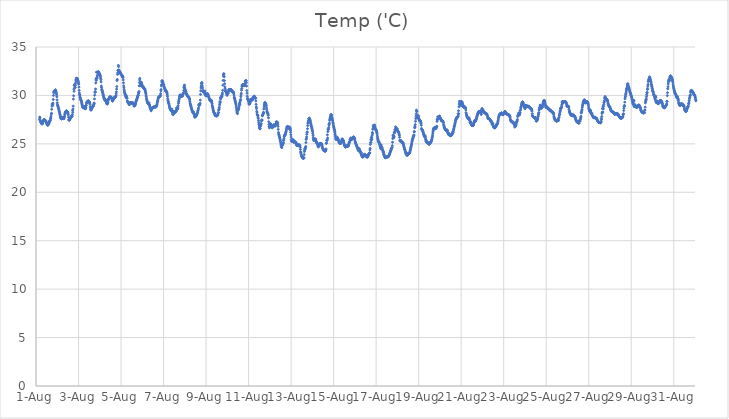
| Category | Temp ('C) |
|---|---|
| 44774.166666666664 | 27.53 |
| 44774.177083333336 | 27.764 |
| 44774.1875 | 27.685 |
| 44774.197916666664 | 27.422 |
| 44774.208333333336 | 27.408 |
| 44774.21875 | 27.271 |
| 44774.229166666664 | 27.233 |
| 44774.239583333336 | 27.194 |
| 44774.25 | 27.159 |
| 44774.260416666664 | 27.115 |
| 44774.270833333336 | 27.08 |
| 44774.28125 | 27.086 |
| 44774.291666666664 | 27.05 |
| 44774.302083333336 | 27.096 |
| 44774.3125 | 27.124 |
| 44774.322916666664 | 27.233 |
| 44774.333333333336 | 27.319 |
| 44774.34375 | 27.361 |
| 44774.354166666664 | 27.417 |
| 44774.364583333336 | 27.465 |
| 44774.375 | 27.492 |
| 44774.385416666664 | 27.49 |
| 44774.395833333336 | 27.493 |
| 44774.40625 | 27.49 |
| 44774.416666666664 | 27.468 |
| 44774.427083333336 | 27.395 |
| 44774.4375 | 27.359 |
| 44774.447916666664 | 27.381 |
| 44774.458333333336 | 27.374 |
| 44774.46875 | 27.339 |
| 44774.479166666664 | 27.259 |
| 44774.489583333336 | 27.196 |
| 44774.5 | 27.146 |
| 44774.510416666664 | 27.075 |
| 44774.520833333336 | 26.983 |
| 44774.53125 | 26.963 |
| 44774.541666666664 | 26.947 |
| 44774.552083333336 | 26.949 |
| 44774.5625 | 26.937 |
| 44774.572916666664 | 26.963 |
| 44774.583333333336 | 27.016 |
| 44774.59375 | 27.066 |
| 44774.604166666664 | 27.12 |
| 44774.614583333336 | 27.188 |
| 44774.625 | 27.265 |
| 44774.635416666664 | 27.316 |
| 44774.645833333336 | 27.355 |
| 44774.65625 | 27.395 |
| 44774.666666666664 | 27.405 |
| 44774.677083333336 | 27.499 |
| 44774.6875 | 27.654 |
| 44774.697916666664 | 27.677 |
| 44774.708333333336 | 27.872 |
| 44774.71875 | 28.084 |
| 44774.729166666664 | 28.154 |
| 44774.739583333336 | 28.573 |
| 44774.75 | 28.884 |
| 44774.760416666664 | 29.088 |
| 44774.770833333336 | 29.148 |
| 44774.78125 | 28.966 |
| 44774.791666666664 | 29.074 |
| 44774.802083333336 | 29.199 |
| 44774.8125 | 29.58 |
| 44774.822916666664 | 30 |
| 44774.833333333336 | 30.273 |
| 44774.84375 | 30.405 |
| 44774.854166666664 | 30.425 |
| 44774.864583333336 | 30.48 |
| 44774.875 | 30.445 |
| 44774.885416666664 | 30.487 |
| 44774.895833333336 | 30.521 |
| 44774.90625 | 30.548 |
| 44774.916666666664 | 30.581 |
| 44774.927083333336 | 30.435 |
| 44774.9375 | 30.391 |
| 44774.947916666664 | 30.339 |
| 44774.958333333336 | 30.21 |
| 44774.96875 | 30.063 |
| 44774.979166666664 | 29.861 |
| 44774.989583333336 | 29.539 |
| 44775.0 | 29.241 |
| 44775.010416666664 | 29.052 |
| 44775.020833333336 | 28.952 |
| 44775.03125 | 28.892 |
| 44775.041666666664 | 28.828 |
| 44775.052083333336 | 28.727 |
| 44775.0625 | 28.665 |
| 44775.072916666664 | 28.57 |
| 44775.083333333336 | 28.473 |
| 44775.09375 | 28.367 |
| 44775.104166666664 | 28.268 |
| 44775.114583333336 | 28.146 |
| 44775.125 | 28.06 |
| 44775.135416666664 | 27.947 |
| 44775.145833333336 | 27.833 |
| 44775.15625 | 27.717 |
| 44775.166666666664 | 27.687 |
| 44775.177083333336 | 27.611 |
| 44775.1875 | 27.578 |
| 44775.197916666664 | 27.567 |
| 44775.208333333336 | 27.768 |
| 44775.21875 | 27.731 |
| 44775.229166666664 | 27.665 |
| 44775.239583333336 | 27.702 |
| 44775.25 | 27.696 |
| 44775.260416666664 | 27.687 |
| 44775.270833333336 | 27.684 |
| 44775.28125 | 27.606 |
| 44775.291666666664 | 27.636 |
| 44775.302083333336 | 27.612 |
| 44775.3125 | 27.591 |
| 44775.322916666664 | 27.691 |
| 44775.333333333336 | 27.803 |
| 44775.34375 | 27.846 |
| 44775.354166666664 | 28.025 |
| 44775.364583333336 | 28.114 |
| 44775.375 | 28.257 |
| 44775.385416666664 | 28.258 |
| 44775.395833333336 | 28.319 |
| 44775.40625 | 28.335 |
| 44775.416666666664 | 28.388 |
| 44775.427083333336 | 28.39 |
| 44775.4375 | 28.373 |
| 44775.447916666664 | 28.384 |
| 44775.458333333336 | 28.342 |
| 44775.46875 | 28.266 |
| 44775.479166666664 | 28.266 |
| 44775.489583333336 | 28.272 |
| 44775.5 | 28.216 |
| 44775.510416666664 | 28.096 |
| 44775.520833333336 | 27.987 |
| 44775.53125 | 27.75 |
| 44775.541666666664 | 27.509 |
| 44775.552083333336 | 27.428 |
| 44775.5625 | 27.467 |
| 44775.572916666664 | 27.479 |
| 44775.583333333336 | 27.503 |
| 44775.59375 | 27.556 |
| 44775.604166666664 | 27.605 |
| 44775.614583333336 | 27.641 |
| 44775.625 | 27.69 |
| 44775.635416666664 | 27.74 |
| 44775.645833333336 | 27.775 |
| 44775.65625 | 27.805 |
| 44775.666666666664 | 27.833 |
| 44775.677083333336 | 27.827 |
| 44775.6875 | 27.832 |
| 44775.697916666664 | 27.881 |
| 44775.708333333336 | 28.022 |
| 44775.71875 | 28.442 |
| 44775.729166666664 | 28.248 |
| 44775.739583333336 | 28.591 |
| 44775.75 | 28.893 |
| 44775.760416666664 | 29.619 |
| 44775.770833333336 | 29.967 |
| 44775.78125 | 30.652 |
| 44775.791666666664 | 30.427 |
| 44775.802083333336 | 31.024 |
| 44775.8125 | 31.125 |
| 44775.822916666664 | 31.078 |
| 44775.833333333336 | 30.803 |
| 44775.84375 | 30.831 |
| 44775.854166666664 | 31.056 |
| 44775.864583333336 | 31.283 |
| 44775.875 | 31.498 |
| 44775.885416666664 | 31.641 |
| 44775.895833333336 | 31.743 |
| 44775.90625 | 31.746 |
| 44775.916666666664 | 31.786 |
| 44775.927083333336 | 31.723 |
| 44775.9375 | 31.752 |
| 44775.947916666664 | 31.729 |
| 44775.958333333336 | 31.615 |
| 44775.96875 | 31.535 |
| 44775.979166666664 | 31.486 |
| 44775.989583333336 | 31.399 |
| 44776.0 | 31.289 |
| 44776.010416666664 | 31.159 |
| 44776.020833333336 | 30.855 |
| 44776.03125 | 30.524 |
| 44776.041666666664 | 30.247 |
| 44776.052083333336 | 30.093 |
| 44776.0625 | 29.959 |
| 44776.072916666664 | 29.811 |
| 44776.083333333336 | 29.739 |
| 44776.09375 | 29.647 |
| 44776.104166666664 | 29.558 |
| 44776.114583333336 | 29.519 |
| 44776.125 | 29.47 |
| 44776.135416666664 | 29.404 |
| 44776.145833333336 | 29.276 |
| 44776.15625 | 29.165 |
| 44776.166666666664 | 29.049 |
| 44776.177083333336 | 28.94 |
| 44776.1875 | 28.836 |
| 44776.197916666664 | 28.758 |
| 44776.208333333336 | 28.782 |
| 44776.21875 | 28.817 |
| 44776.229166666664 | 28.866 |
| 44776.239583333336 | 28.711 |
| 44776.25 | 28.854 |
| 44776.260416666664 | 28.759 |
| 44776.270833333336 | 28.811 |
| 44776.28125 | 28.788 |
| 44776.291666666664 | 28.727 |
| 44776.302083333336 | 28.66 |
| 44776.3125 | 28.675 |
| 44776.322916666664 | 28.625 |
| 44776.333333333336 | 28.64 |
| 44776.34375 | 28.77 |
| 44776.354166666664 | 28.951 |
| 44776.364583333336 | 28.991 |
| 44776.375 | 29.194 |
| 44776.385416666664 | 29.268 |
| 44776.395833333336 | 29.308 |
| 44776.40625 | 29.326 |
| 44776.416666666664 | 29.328 |
| 44776.427083333336 | 29.38 |
| 44776.4375 | 29.403 |
| 44776.447916666664 | 29.402 |
| 44776.458333333336 | 29.442 |
| 44776.46875 | 29.442 |
| 44776.479166666664 | 29.35 |
| 44776.489583333336 | 29.294 |
| 44776.5 | 29.318 |
| 44776.510416666664 | 29.323 |
| 44776.520833333336 | 29.286 |
| 44776.53125 | 29.221 |
| 44776.541666666664 | 29.085 |
| 44776.552083333336 | 28.827 |
| 44776.5625 | 28.693 |
| 44776.572916666664 | 28.532 |
| 44776.583333333336 | 28.485 |
| 44776.59375 | 28.51 |
| 44776.604166666664 | 28.547 |
| 44776.614583333336 | 28.596 |
| 44776.625 | 28.659 |
| 44776.635416666664 | 28.719 |
| 44776.645833333336 | 28.785 |
| 44776.65625 | 28.815 |
| 44776.666666666664 | 28.867 |
| 44776.677083333336 | 28.905 |
| 44776.6875 | 28.854 |
| 44776.697916666664 | 28.937 |
| 44776.708333333336 | 28.981 |
| 44776.71875 | 29.075 |
| 44776.729166666664 | 29.21 |
| 44776.739583333336 | 29.178 |
| 44776.75 | 29.644 |
| 44776.760416666664 | 30.02 |
| 44776.770833333336 | 30.356 |
| 44776.78125 | 30.318 |
| 44776.791666666664 | 30.392 |
| 44776.802083333336 | 30.665 |
| 44776.8125 | 31.287 |
| 44776.822916666664 | 31.683 |
| 44776.833333333336 | 31.542 |
| 44776.84375 | 32.399 |
| 44776.854166666664 | 31.808 |
| 44776.864583333336 | 31.748 |
| 44776.875 | 31.865 |
| 44776.885416666664 | 32.049 |
| 44776.895833333336 | 32.07 |
| 44776.90625 | 32.381 |
| 44776.916666666664 | 32.363 |
| 44776.927083333336 | 32.469 |
| 44776.9375 | 32.378 |
| 44776.947916666664 | 32.37 |
| 44776.958333333336 | 32.4 |
| 44776.96875 | 32.295 |
| 44776.979166666664 | 32.267 |
| 44776.989583333336 | 32.204 |
| 44777.0 | 32.138 |
| 44777.010416666664 | 32.074 |
| 44777.020833333336 | 32.019 |
| 44777.03125 | 31.933 |
| 44777.041666666664 | 31.772 |
| 44777.052083333336 | 31.632 |
| 44777.0625 | 31.394 |
| 44777.072916666664 | 30.97 |
| 44777.083333333336 | 30.81 |
| 44777.09375 | 30.618 |
| 44777.104166666664 | 30.554 |
| 44777.114583333336 | 30.483 |
| 44777.125 | 30.384 |
| 44777.135416666664 | 30.301 |
| 44777.145833333336 | 30.159 |
| 44777.15625 | 30.123 |
| 44777.166666666664 | 30.016 |
| 44777.177083333336 | 29.925 |
| 44777.1875 | 29.8 |
| 44777.197916666664 | 29.74 |
| 44777.208333333336 | 29.677 |
| 44777.21875 | 29.615 |
| 44777.229166666664 | 29.566 |
| 44777.239583333336 | 29.537 |
| 44777.25 | 29.475 |
| 44777.260416666664 | 29.57 |
| 44777.270833333336 | 29.563 |
| 44777.28125 | 29.494 |
| 44777.291666666664 | 29.459 |
| 44777.302083333336 | 29.374 |
| 44777.3125 | 29.274 |
| 44777.322916666664 | 29.157 |
| 44777.333333333336 | 29.169 |
| 44777.34375 | 29.171 |
| 44777.354166666664 | 29.098 |
| 44777.364583333336 | 29.331 |
| 44777.375 | 29.205 |
| 44777.385416666664 | 29.285 |
| 44777.395833333336 | 29.486 |
| 44777.40625 | 29.582 |
| 44777.416666666664 | 29.662 |
| 44777.427083333336 | 29.655 |
| 44777.4375 | 29.708 |
| 44777.447916666664 | 29.741 |
| 44777.458333333336 | 29.796 |
| 44777.46875 | 29.835 |
| 44777.479166666664 | 29.848 |
| 44777.489583333336 | 29.867 |
| 44777.5 | 29.85 |
| 44777.510416666664 | 29.831 |
| 44777.520833333336 | 29.8 |
| 44777.53125 | 29.82 |
| 44777.541666666664 | 29.8 |
| 44777.552083333336 | 29.738 |
| 44777.5625 | 29.716 |
| 44777.572916666664 | 29.592 |
| 44777.583333333336 | 29.498 |
| 44777.59375 | 29.445 |
| 44777.604166666664 | 29.431 |
| 44777.614583333336 | 29.463 |
| 44777.625 | 29.539 |
| 44777.635416666664 | 29.597 |
| 44777.645833333336 | 29.631 |
| 44777.65625 | 29.683 |
| 44777.666666666664 | 29.717 |
| 44777.677083333336 | 29.771 |
| 44777.6875 | 29.798 |
| 44777.697916666664 | 29.794 |
| 44777.708333333336 | 29.781 |
| 44777.71875 | 29.827 |
| 44777.729166666664 | 29.814 |
| 44777.739583333336 | 29.848 |
| 44777.75 | 29.897 |
| 44777.760416666664 | 29.973 |
| 44777.770833333336 | 30.159 |
| 44777.78125 | 30.368 |
| 44777.791666666664 | 30.655 |
| 44777.802083333336 | 30.919 |
| 44777.8125 | 31.543 |
| 44777.822916666664 | 31.651 |
| 44777.833333333336 | 32.173 |
| 44777.84375 | 32.328 |
| 44777.854166666664 | 32.586 |
| 44777.864583333336 | 32.587 |
| 44777.875 | 33.096 |
| 44777.885416666664 | 32.98 |
| 44777.895833333336 | 32.639 |
| 44777.90625 | 32.479 |
| 44777.916666666664 | 32.376 |
| 44777.927083333336 | 32.474 |
| 44777.9375 | 32.482 |
| 44777.947916666664 | 32.425 |
| 44777.958333333336 | 32.353 |
| 44777.96875 | 32.295 |
| 44777.979166666664 | 32.265 |
| 44777.989583333336 | 32.235 |
| 44778.0 | 32.183 |
| 44778.010416666664 | 32.167 |
| 44778.020833333336 | 32.131 |
| 44778.03125 | 32.116 |
| 44778.041666666664 | 32.056 |
| 44778.052083333336 | 31.924 |
| 44778.0625 | 31.999 |
| 44778.072916666664 | 31.999 |
| 44778.083333333336 | 31.959 |
| 44778.09375 | 31.838 |
| 44778.104166666664 | 31.601 |
| 44778.114583333336 | 31.298 |
| 44778.125 | 30.983 |
| 44778.135416666664 | 30.793 |
| 44778.145833333336 | 30.585 |
| 44778.15625 | 30.44 |
| 44778.166666666664 | 30.316 |
| 44778.177083333336 | 30.226 |
| 44778.1875 | 30.147 |
| 44778.197916666664 | 30.104 |
| 44778.208333333336 | 30.022 |
| 44778.21875 | 29.92 |
| 44778.229166666664 | 29.85 |
| 44778.239583333336 | 29.781 |
| 44778.25 | 29.811 |
| 44778.260416666664 | 29.933 |
| 44778.270833333336 | 29.784 |
| 44778.28125 | 29.693 |
| 44778.291666666664 | 29.427 |
| 44778.302083333336 | 29.385 |
| 44778.3125 | 29.343 |
| 44778.322916666664 | 29.333 |
| 44778.333333333336 | 29.258 |
| 44778.34375 | 29.226 |
| 44778.354166666664 | 29.218 |
| 44778.364583333336 | 29.251 |
| 44778.375 | 29.063 |
| 44778.385416666664 | 29.107 |
| 44778.395833333336 | 29.125 |
| 44778.40625 | 29.066 |
| 44778.416666666664 | 29.119 |
| 44778.427083333336 | 29.185 |
| 44778.4375 | 29.243 |
| 44778.447916666664 | 29.253 |
| 44778.458333333336 | 29.281 |
| 44778.46875 | 29.274 |
| 44778.479166666664 | 29.245 |
| 44778.489583333336 | 29.208 |
| 44778.5 | 29.241 |
| 44778.510416666664 | 29.24 |
| 44778.520833333336 | 29.235 |
| 44778.53125 | 29.228 |
| 44778.541666666664 | 29.192 |
| 44778.552083333336 | 29.186 |
| 44778.5625 | 29.213 |
| 44778.572916666664 | 29.211 |
| 44778.583333333336 | 29.165 |
| 44778.59375 | 29.079 |
| 44778.604166666664 | 29.01 |
| 44778.614583333336 | 28.901 |
| 44778.625 | 28.918 |
| 44778.635416666664 | 28.933 |
| 44778.645833333336 | 28.95 |
| 44778.65625 | 28.978 |
| 44778.666666666664 | 29.048 |
| 44778.677083333336 | 29.131 |
| 44778.6875 | 29.219 |
| 44778.697916666664 | 29.336 |
| 44778.708333333336 | 29.402 |
| 44778.71875 | 29.468 |
| 44778.729166666664 | 29.524 |
| 44778.739583333336 | 29.595 |
| 44778.75 | 29.662 |
| 44778.760416666664 | 29.736 |
| 44778.770833333336 | 29.812 |
| 44778.78125 | 29.876 |
| 44778.791666666664 | 29.952 |
| 44778.802083333336 | 30.008 |
| 44778.8125 | 30.05 |
| 44778.822916666664 | 30.247 |
| 44778.833333333336 | 30.28 |
| 44778.84375 | 30.417 |
| 44778.854166666664 | 30.987 |
| 44778.864583333336 | 31.334 |
| 44778.875 | 31.599 |
| 44778.885416666664 | 31.754 |
| 44778.895833333336 | 31.001 |
| 44778.90625 | 31.283 |
| 44778.916666666664 | 31.038 |
| 44778.927083333336 | 31.058 |
| 44778.9375 | 31.188 |
| 44778.947916666664 | 31.373 |
| 44778.958333333336 | 31.33 |
| 44778.96875 | 31.232 |
| 44778.979166666664 | 31.12 |
| 44778.989583333336 | 31.041 |
| 44779.0 | 30.965 |
| 44779.010416666664 | 30.93 |
| 44779.020833333336 | 30.894 |
| 44779.03125 | 30.859 |
| 44779.041666666664 | 30.851 |
| 44779.052083333336 | 30.839 |
| 44779.0625 | 30.854 |
| 44779.072916666664 | 30.737 |
| 44779.083333333336 | 30.681 |
| 44779.09375 | 30.713 |
| 44779.104166666664 | 30.694 |
| 44779.114583333336 | 30.675 |
| 44779.125 | 30.642 |
| 44779.135416666664 | 30.539 |
| 44779.145833333336 | 30.419 |
| 44779.15625 | 30.317 |
| 44779.166666666664 | 30.188 |
| 44779.177083333336 | 30.041 |
| 44779.1875 | 29.884 |
| 44779.197916666664 | 29.71 |
| 44779.208333333336 | 29.573 |
| 44779.21875 | 29.478 |
| 44779.229166666664 | 29.377 |
| 44779.239583333336 | 29.323 |
| 44779.25 | 29.244 |
| 44779.260416666664 | 29.203 |
| 44779.270833333336 | 29.175 |
| 44779.28125 | 29.159 |
| 44779.291666666664 | 29.11 |
| 44779.302083333336 | 29.084 |
| 44779.3125 | 29.062 |
| 44779.322916666664 | 29.221 |
| 44779.333333333336 | 29.055 |
| 44779.34375 | 28.986 |
| 44779.354166666664 | 28.832 |
| 44779.364583333336 | 28.71 |
| 44779.375 | 28.744 |
| 44779.385416666664 | 28.684 |
| 44779.395833333336 | 28.541 |
| 44779.40625 | 28.553 |
| 44779.416666666664 | 28.41 |
| 44779.427083333336 | 28.52 |
| 44779.4375 | 28.619 |
| 44779.447916666664 | 28.642 |
| 44779.458333333336 | 28.669 |
| 44779.46875 | 28.705 |
| 44779.479166666664 | 28.738 |
| 44779.489583333336 | 28.752 |
| 44779.5 | 28.771 |
| 44779.510416666664 | 28.749 |
| 44779.520833333336 | 28.719 |
| 44779.53125 | 28.783 |
| 44779.541666666664 | 28.807 |
| 44779.552083333336 | 28.813 |
| 44779.5625 | 28.808 |
| 44779.572916666664 | 28.825 |
| 44779.583333333336 | 28.809 |
| 44779.59375 | 28.808 |
| 44779.604166666664 | 28.821 |
| 44779.614583333336 | 28.836 |
| 44779.625 | 28.824 |
| 44779.635416666664 | 28.81 |
| 44779.645833333336 | 28.814 |
| 44779.65625 | 28.867 |
| 44779.666666666664 | 28.903 |
| 44779.677083333336 | 28.973 |
| 44779.6875 | 29.058 |
| 44779.697916666664 | 29.193 |
| 44779.708333333336 | 29.312 |
| 44779.71875 | 29.395 |
| 44779.729166666664 | 29.476 |
| 44779.739583333336 | 29.621 |
| 44779.75 | 29.712 |
| 44779.760416666664 | 29.78 |
| 44779.770833333336 | 29.806 |
| 44779.78125 | 29.855 |
| 44779.791666666664 | 29.869 |
| 44779.802083333336 | 29.864 |
| 44779.8125 | 29.881 |
| 44779.822916666664 | 29.909 |
| 44779.833333333336 | 29.923 |
| 44779.84375 | 29.955 |
| 44779.854166666664 | 30.004 |
| 44779.864583333336 | 30.181 |
| 44779.875 | 30.467 |
| 44779.885416666664 | 30.608 |
| 44779.895833333336 | 30.989 |
| 44779.90625 | 31.1 |
| 44779.916666666664 | 31.397 |
| 44779.927083333336 | 31.513 |
| 44779.9375 | 31.509 |
| 44779.947916666664 | 31.378 |
| 44779.958333333336 | 31.416 |
| 44779.96875 | 31.384 |
| 44779.979166666664 | 31.28 |
| 44779.989583333336 | 31.156 |
| 44780.0 | 31.092 |
| 44780.010416666664 | 31.086 |
| 44780.020833333336 | 30.942 |
| 44780.03125 | 30.828 |
| 44780.041666666664 | 30.802 |
| 44780.052083333336 | 30.726 |
| 44780.0625 | 30.673 |
| 44780.072916666664 | 30.622 |
| 44780.083333333336 | 30.567 |
| 44780.09375 | 30.489 |
| 44780.104166666664 | 30.445 |
| 44780.114583333336 | 30.432 |
| 44780.125 | 30.385 |
| 44780.135416666664 | 30.4 |
| 44780.145833333336 | 30.414 |
| 44780.15625 | 30.303 |
| 44780.166666666664 | 30.194 |
| 44780.177083333336 | 30.056 |
| 44780.1875 | 29.885 |
| 44780.197916666664 | 29.654 |
| 44780.208333333336 | 29.498 |
| 44780.21875 | 29.39 |
| 44780.229166666664 | 29.302 |
| 44780.239583333336 | 29.209 |
| 44780.25 | 29.139 |
| 44780.260416666664 | 29.028 |
| 44780.270833333336 | 28.912 |
| 44780.28125 | 28.813 |
| 44780.291666666664 | 28.713 |
| 44780.302083333336 | 28.657 |
| 44780.3125 | 28.599 |
| 44780.322916666664 | 28.568 |
| 44780.333333333336 | 28.54 |
| 44780.34375 | 28.5 |
| 44780.354166666664 | 28.457 |
| 44780.364583333336 | 28.427 |
| 44780.375 | 28.398 |
| 44780.385416666664 | 28.6 |
| 44780.395833333336 | 28.466 |
| 44780.40625 | 28.343 |
| 44780.416666666664 | 28.232 |
| 44780.427083333336 | 28.211 |
| 44780.4375 | 28.03 |
| 44780.447916666664 | 28.124 |
| 44780.458333333336 | 28.036 |
| 44780.46875 | 28.18 |
| 44780.479166666664 | 28.359 |
| 44780.489583333336 | 28.368 |
| 44780.5 | 28.322 |
| 44780.510416666664 | 28.285 |
| 44780.520833333336 | 28.273 |
| 44780.53125 | 28.297 |
| 44780.541666666664 | 28.26 |
| 44780.552083333336 | 28.259 |
| 44780.5625 | 28.292 |
| 44780.572916666664 | 28.326 |
| 44780.583333333336 | 28.357 |
| 44780.59375 | 28.384 |
| 44780.604166666664 | 28.513 |
| 44780.614583333336 | 28.705 |
| 44780.625 | 28.717 |
| 44780.635416666664 | 28.605 |
| 44780.645833333336 | 28.57 |
| 44780.65625 | 28.571 |
| 44780.666666666664 | 28.64 |
| 44780.677083333336 | 28.765 |
| 44780.6875 | 28.942 |
| 44780.697916666664 | 29.176 |
| 44780.708333333336 | 29.336 |
| 44780.71875 | 29.414 |
| 44780.729166666664 | 29.565 |
| 44780.739583333336 | 29.715 |
| 44780.75 | 29.832 |
| 44780.760416666664 | 29.924 |
| 44780.770833333336 | 30.024 |
| 44780.78125 | 30.06 |
| 44780.791666666664 | 29.971 |
| 44780.802083333336 | 29.94 |
| 44780.8125 | 29.934 |
| 44780.822916666664 | 29.927 |
| 44780.833333333336 | 29.898 |
| 44780.84375 | 29.934 |
| 44780.854166666664 | 29.924 |
| 44780.864583333336 | 29.944 |
| 44780.875 | 29.945 |
| 44780.885416666664 | 29.945 |
| 44780.895833333336 | 29.943 |
| 44780.90625 | 30.083 |
| 44780.916666666664 | 30.162 |
| 44780.927083333336 | 30.191 |
| 44780.9375 | 30.261 |
| 44780.947916666664 | 30.512 |
| 44780.958333333336 | 30.799 |
| 44780.96875 | 30.893 |
| 44780.979166666664 | 31.05 |
| 44780.989583333336 | 31.032 |
| 44781.0 | 30.776 |
| 44781.010416666664 | 30.658 |
| 44781.020833333336 | 30.56 |
| 44781.03125 | 30.474 |
| 44781.041666666664 | 30.422 |
| 44781.052083333336 | 30.376 |
| 44781.0625 | 30.238 |
| 44781.072916666664 | 30.15 |
| 44781.083333333336 | 30.141 |
| 44781.09375 | 30.093 |
| 44781.104166666664 | 30.052 |
| 44781.114583333336 | 30.001 |
| 44781.125 | 29.959 |
| 44781.135416666664 | 29.905 |
| 44781.145833333336 | 29.874 |
| 44781.15625 | 29.86 |
| 44781.166666666664 | 29.818 |
| 44781.177083333336 | 29.829 |
| 44781.1875 | 29.837 |
| 44781.197916666664 | 29.819 |
| 44781.208333333336 | 29.715 |
| 44781.21875 | 29.644 |
| 44781.229166666664 | 29.536 |
| 44781.239583333336 | 29.369 |
| 44781.25 | 29.198 |
| 44781.260416666664 | 29.104 |
| 44781.270833333336 | 29.018 |
| 44781.28125 | 28.932 |
| 44781.291666666664 | 28.855 |
| 44781.302083333336 | 28.757 |
| 44781.3125 | 28.678 |
| 44781.322916666664 | 28.572 |
| 44781.333333333336 | 28.5 |
| 44781.34375 | 28.44 |
| 44781.354166666664 | 28.36 |
| 44781.364583333336 | 28.312 |
| 44781.375 | 28.271 |
| 44781.385416666664 | 28.22 |
| 44781.395833333336 | 28.191 |
| 44781.40625 | 28.162 |
| 44781.416666666664 | 28.291 |
| 44781.427083333336 | 28.154 |
| 44781.4375 | 28.045 |
| 44781.447916666664 | 28.015 |
| 44781.458333333336 | 27.815 |
| 44781.46875 | 27.751 |
| 44781.479166666664 | 27.987 |
| 44781.489583333336 | 27.804 |
| 44781.5 | 27.796 |
| 44781.510416666664 | 27.919 |
| 44781.520833333336 | 27.973 |
| 44781.53125 | 27.966 |
| 44781.541666666664 | 27.91 |
| 44781.55210648148 | 27.921 |
| 44781.5625 | 27.993 |
| 44781.572916666664 | 28.086 |
| 44781.583333333336 | 28.106 |
| 44781.59375 | 28.216 |
| 44781.604166666664 | 28.302 |
| 44781.614583333336 | 28.409 |
| 44781.625 | 28.481 |
| 44781.635416666664 | 28.597 |
| 44781.645833333336 | 28.716 |
| 44781.65625 | 28.97 |
| 44781.666666666664 | 29.051 |
| 44781.677083333336 | 29.081 |
| 44781.6875 | 29.053 |
| 44781.697916666664 | 28.99 |
| 44781.708333333336 | 29.078 |
| 44781.71875 | 29.186 |
| 44781.729166666664 | 29.515 |
| 44781.739583333336 | 30.104 |
| 44781.75 | 30.48 |
| 44781.760416666664 | 30.781 |
| 44781.770833333336 | 30.982 |
| 44781.78125 | 31.219 |
| 44781.791666666664 | 31.289 |
| 44781.802083333336 | 31.33 |
| 44781.8125 | 31.213 |
| 44781.822916666664 | 30.972 |
| 44781.833333333336 | 30.774 |
| 44781.84375 | 30.533 |
| 44781.854166666664 | 30.381 |
| 44781.864583333336 | 30.371 |
| 44781.875 | 30.365 |
| 44781.885416666664 | 30.392 |
| 44781.895833333336 | 30.399 |
| 44781.90625 | 30.403 |
| 44781.916666666664 | 30.354 |
| 44781.927083333336 | 30.286 |
| 44781.9375 | 30.156 |
| 44781.947916666664 | 30.465 |
| 44781.958333333336 | 30.238 |
| 44781.96875 | 30.097 |
| 44781.979166666664 | 29.993 |
| 44781.989583333336 | 29.96 |
| 44782.0 | 30.027 |
| 44782.010416666664 | 29.998 |
| 44782.020833333336 | 29.971 |
| 44782.03125 | 30.143 |
| 44782.041666666664 | 30.032 |
| 44782.052083333336 | 30.051 |
| 44782.0625 | 30.186 |
| 44782.072916666664 | 30.16 |
| 44782.083333333336 | 30.073 |
| 44782.09375 | 30.09 |
| 44782.104166666664 | 29.955 |
| 44782.114583333336 | 29.916 |
| 44782.125 | 29.854 |
| 44782.135416666664 | 29.796 |
| 44782.145833333336 | 29.702 |
| 44782.15625 | 29.64 |
| 44782.166666666664 | 29.594 |
| 44782.177083333336 | 29.537 |
| 44782.1875 | 29.498 |
| 44782.197916666664 | 29.447 |
| 44782.208333333336 | 29.445 |
| 44782.21875 | 29.441 |
| 44782.229166666664 | 29.46 |
| 44782.239583333336 | 29.477 |
| 44782.25 | 29.497 |
| 44782.260416666664 | 29.411 |
| 44782.270833333336 | 29.306 |
| 44782.28125 | 29.146 |
| 44782.291666666664 | 28.971 |
| 44782.302083333336 | 28.843 |
| 44782.3125 | 28.746 |
| 44782.322916666664 | 28.631 |
| 44782.333333333336 | 28.512 |
| 44782.34375 | 28.431 |
| 44782.354166666664 | 28.335 |
| 44782.364583333336 | 28.264 |
| 44782.375 | 28.222 |
| 44782.385416666664 | 28.185 |
| 44782.395833333336 | 28.144 |
| 44782.40625 | 28.093 |
| 44782.416666666664 | 28.014 |
| 44782.427083333336 | 27.952 |
| 44782.4375 | 27.935 |
| 44782.447916666664 | 27.923 |
| 44782.458333333336 | 27.901 |
| 44782.46875 | 27.929 |
| 44782.479166666664 | 27.9 |
| 44782.489583333336 | 27.895 |
| 44782.5 | 27.881 |
| 44782.510416666664 | 27.912 |
| 44782.520833333336 | 27.942 |
| 44782.53125 | 27.974 |
| 44782.541666666664 | 27.976 |
| 44782.552083333336 | 27.97 |
| 44782.5625 | 28.098 |
| 44782.572916666664 | 28.224 |
| 44782.583333333336 | 28.242 |
| 44782.59375 | 28.497 |
| 44782.604166666664 | 28.523 |
| 44782.614583333336 | 28.615 |
| 44782.625 | 28.783 |
| 44782.635416666664 | 29.026 |
| 44782.645833333336 | 29.211 |
| 44782.65625 | 29.365 |
| 44782.666666666664 | 29.304 |
| 44782.677083333336 | 29.724 |
| 44782.6875 | 29.618 |
| 44782.697916666664 | 29.753 |
| 44782.708333333336 | 29.893 |
| 44782.71875 | 29.828 |
| 44782.729166666664 | 29.818 |
| 44782.739583333336 | 29.848 |
| 44782.75 | 29.931 |
| 44782.760416666664 | 30.09 |
| 44782.770833333336 | 30.241 |
| 44782.78125 | 30.52 |
| 44782.791666666664 | 31.06 |
| 44782.802083333336 | 31.55 |
| 44782.8125 | 32.008 |
| 44782.822916666664 | 32.134 |
| 44782.833333333336 | 32.245 |
| 44782.84375 | 32.207 |
| 44782.854166666664 | 31.927 |
| 44782.864583333336 | 31.526 |
| 44782.875 | 31.208 |
| 44782.885416666664 | 30.886 |
| 44782.895833333336 | 30.708 |
| 44782.90625 | 30.425 |
| 44782.916666666664 | 30.521 |
| 44782.927083333336 | 30.467 |
| 44782.9375 | 30.437 |
| 44782.947916666664 | 30.38 |
| 44782.958333333336 | 30.288 |
| 44782.96875 | 30.174 |
| 44782.979166666664 | 30.097 |
| 44782.989583333336 | 30.001 |
| 44783.0 | 30.189 |
| 44783.010416666664 | 30.296 |
| 44783.020833333336 | 30.283 |
| 44783.03125 | 30.257 |
| 44783.041666666664 | 30.203 |
| 44783.052083333336 | 30.414 |
| 44783.0625 | 30.453 |
| 44783.072916666664 | 30.598 |
| 44783.083333333336 | 30.611 |
| 44783.09375 | 30.621 |
| 44783.104166666664 | 30.565 |
| 44783.114583333336 | 30.566 |
| 44783.125 | 30.517 |
| 44783.135416666664 | 30.527 |
| 44783.145833333336 | 30.61 |
| 44783.15625 | 30.615 |
| 44783.166666666664 | 30.614 |
| 44783.177083333336 | 30.589 |
| 44783.1875 | 30.563 |
| 44783.197916666664 | 30.497 |
| 44783.208333333336 | 30.394 |
| 44783.21875 | 30.439 |
| 44783.229166666664 | 30.429 |
| 44783.239583333336 | 30.409 |
| 44783.25 | 30.387 |
| 44783.260416666664 | 30.306 |
| 44783.270833333336 | 30.36 |
| 44783.28125 | 30.366 |
| 44783.291666666664 | 30.309 |
| 44783.302083333336 | 30.241 |
| 44783.3125 | 30.046 |
| 44783.322916666664 | 29.825 |
| 44783.333333333336 | 29.741 |
| 44783.34375 | 29.686 |
| 44783.354166666664 | 29.602 |
| 44783.364583333336 | 29.493 |
| 44783.375 | 29.383 |
| 44783.385416666664 | 29.3 |
| 44783.395833333336 | 29.187 |
| 44783.40625 | 29.07 |
| 44783.416666666664 | 28.9 |
| 44783.427083333336 | 28.718 |
| 44783.4375 | 28.523 |
| 44783.447916666664 | 28.381 |
| 44783.458333333336 | 28.245 |
| 44783.46875 | 28.159 |
| 44783.479166666664 | 28.125 |
| 44783.489583333336 | 28.418 |
| 44783.5 | 28.612 |
| 44783.510416666664 | 28.473 |
| 44783.520833333336 | 28.571 |
| 44783.53125 | 28.621 |
| 44783.541666666664 | 28.689 |
| 44783.552083333336 | 28.821 |
| 44783.5625 | 28.971 |
| 44783.572916666664 | 29.132 |
| 44783.583333333336 | 29.262 |
| 44783.59375 | 29.1 |
| 44783.604166666664 | 29.411 |
| 44783.614583333336 | 29.5 |
| 44783.625 | 29.588 |
| 44783.635416666664 | 29.876 |
| 44783.645833333336 | 30.06 |
| 44783.65625 | 30.221 |
| 44783.666666666664 | 30.543 |
| 44783.677083333336 | 30.707 |
| 44783.6875 | 30.909 |
| 44783.697916666664 | 31.057 |
| 44783.708333333336 | 31.085 |
| 44783.71875 | 31.086 |
| 44783.729166666664 | 31.112 |
| 44783.739583333336 | 31.116 |
| 44783.75 | 31.119 |
| 44783.760416666664 | 31.057 |
| 44783.770833333336 | 31.018 |
| 44783.78125 | 31.059 |
| 44783.791666666664 | 31.154 |
| 44783.802083333336 | 31.003 |
| 44783.8125 | 31.025 |
| 44783.822916666664 | 31.112 |
| 44783.833333333336 | 31.229 |
| 44783.84375 | 31.454 |
| 44783.854166666664 | 31.514 |
| 44783.864583333336 | 31.511 |
| 44783.875 | 31.526 |
| 44783.885416666664 | 31.513 |
| 44783.895833333336 | 31.311 |
| 44783.90625 | 30.968 |
| 44783.916666666664 | 30.505 |
| 44783.927083333336 | 30.229 |
| 44783.9375 | 29.914 |
| 44783.947916666664 | 29.692 |
| 44783.958333333336 | 29.585 |
| 44783.96875 | 29.647 |
| 44783.979166666664 | 29.614 |
| 44783.989583333336 | 29.481 |
| 44784.0 | 29.352 |
| 44784.010416666664 | 29.217 |
| 44784.020833333336 | 29.088 |
| 44784.03125 | 29.45 |
| 44784.041666666664 | 29.2 |
| 44784.052083333336 | 29.121 |
| 44784.0625 | 29.203 |
| 44784.072916666664 | 29.244 |
| 44784.083333333336 | 29.391 |
| 44784.09375 | 29.435 |
| 44784.104166666664 | 29.465 |
| 44784.114583333336 | 29.546 |
| 44784.125 | 29.645 |
| 44784.135416666664 | 29.545 |
| 44784.145833333336 | 29.581 |
| 44784.15625 | 29.556 |
| 44784.166666666664 | 29.585 |
| 44784.177083333336 | 29.517 |
| 44784.1875 | 29.579 |
| 44784.197916666664 | 29.679 |
| 44784.208333333336 | 29.814 |
| 44784.21875 | 29.717 |
| 44784.229166666664 | 29.732 |
| 44784.239583333336 | 29.882 |
| 44784.25 | 29.819 |
| 44784.260416666664 | 29.793 |
| 44784.270833333336 | 29.931 |
| 44784.28125 | 29.856 |
| 44784.291666666664 | 29.794 |
| 44784.302083333336 | 29.731 |
| 44784.3125 | 29.707 |
| 44784.322916666664 | 29.744 |
| 44784.333333333336 | 29.694 |
| 44784.34375 | 29.421 |
| 44784.354166666664 | 29.075 |
| 44784.364583333336 | 28.805 |
| 44784.375 | 28.643 |
| 44784.385416666664 | 28.362 |
| 44784.395833333336 | 28.207 |
| 44784.40625 | 28.018 |
| 44784.416666666664 | 27.977 |
| 44784.427083333336 | 27.955 |
| 44784.4375 | 27.895 |
| 44784.447916666664 | 27.748 |
| 44784.458333333336 | 27.597 |
| 44784.46875 | 27.382 |
| 44784.479166666664 | 27.173 |
| 44784.489583333336 | 27.008 |
| 44784.5 | 26.857 |
| 44784.510416666664 | 26.721 |
| 44784.520833333336 | 26.607 |
| 44784.53125 | 26.581 |
| 44784.541666666664 | 26.553 |
| 44784.552083333336 | 26.773 |
| 44784.5625 | 27.003 |
| 44784.572916666664 | 26.886 |
| 44784.583333333336 | 27.066 |
| 44784.59375 | 27.078 |
| 44784.604166666664 | 27.371 |
| 44784.614583333336 | 27.45 |
| 44784.625 | 27.43 |
| 44784.635416666664 | 27.47 |
| 44784.645833333336 | 27.892 |
| 44784.65625 | 27.938 |
| 44784.666666666664 | 27.996 |
| 44784.677083333336 | 28.042 |
| 44784.6875 | 28.121 |
| 44784.697916666664 | 28.256 |
| 44784.708333333336 | 28.192 |
| 44784.71875 | 28.594 |
| 44784.729166666664 | 28.818 |
| 44784.739583333336 | 29.002 |
| 44784.75 | 29.106 |
| 44784.760416666664 | 29.221 |
| 44784.770833333336 | 29.263 |
| 44784.78125 | 29.238 |
| 44784.791666666664 | 29.163 |
| 44784.802083333336 | 28.959 |
| 44784.8125 | 29.134 |
| 44784.822916666664 | 29.032 |
| 44784.833333333336 | 28.915 |
| 44784.84375 | 28.699 |
| 44784.854166666664 | 28.527 |
| 44784.864583333336 | 28.339 |
| 44784.875 | 28.272 |
| 44784.885416666664 | 28.242 |
| 44784.895833333336 | 28.172 |
| 44784.90625 | 28.099 |
| 44784.916666666664 | 28 |
| 44784.927083333336 | 27.937 |
| 44784.9375 | 27.683 |
| 44784.947916666664 | 27.281 |
| 44784.958333333336 | 27.007 |
| 44784.96875 | 26.773 |
| 44784.979166666664 | 26.662 |
| 44784.989583333336 | 26.696 |
| 44785.0 | 26.829 |
| 44785.010416666664 | 27.007 |
| 44785.020833333336 | 27.05 |
| 44785.03125 | 27.075 |
| 44785.041666666664 | 27.05 |
| 44785.052083333336 | 26.97 |
| 44785.0625 | 26.881 |
| 44785.072916666664 | 26.843 |
| 44785.083333333336 | 26.857 |
| 44785.09375 | 26.778 |
| 44785.104166666664 | 26.694 |
| 44785.114583333336 | 26.646 |
| 44785.125 | 26.812 |
| 44785.135416666664 | 26.815 |
| 44785.145833333336 | 26.781 |
| 44785.15625 | 26.82 |
| 44785.166666666664 | 26.81 |
| 44785.177083333336 | 26.918 |
| 44785.1875 | 26.969 |
| 44785.197916666664 | 26.978 |
| 44785.208333333336 | 26.885 |
| 44785.21875 | 26.879 |
| 44785.229166666664 | 26.84 |
| 44785.239583333336 | 26.858 |
| 44785.25 | 26.847 |
| 44785.260416666664 | 26.88 |
| 44785.270833333336 | 26.995 |
| 44785.28125 | 27.012 |
| 44785.291666666664 | 27.026 |
| 44785.302083333336 | 27.277 |
| 44785.3125 | 27.23 |
| 44785.322916666664 | 27.248 |
| 44785.333333333336 | 27.141 |
| 44785.34375 | 27.084 |
| 44785.354166666664 | 27.244 |
| 44785.364583333336 | 27.179 |
| 44785.375 | 27.022 |
| 44785.385416666664 | 26.802 |
| 44785.395833333336 | 26.493 |
| 44785.40625 | 26.172 |
| 44785.416666666664 | 26.023 |
| 44785.427083333336 | 25.939 |
| 44785.4375 | 25.897 |
| 44785.447916666664 | 25.766 |
| 44785.458333333336 | 25.66 |
| 44785.46875 | 25.585 |
| 44785.479166666664 | 25.477 |
| 44785.489583333336 | 25.376 |
| 44785.5 | 25.243 |
| 44785.510416666664 | 25.114 |
| 44785.520833333336 | 24.977 |
| 44785.53125 | 24.844 |
| 44785.541666666664 | 24.74 |
| 44785.552083333336 | 24.643 |
| 44785.5625 | 24.615 |
| 44785.572916666664 | 24.834 |
| 44785.583333333336 | 24.88 |
| 44785.59375 | 24.919 |
| 44785.604166666664 | 24.873 |
| 44785.614583333336 | 25.017 |
| 44785.625 | 25.022 |
| 44785.635416666664 | 25.147 |
| 44785.645833333336 | 25.357 |
| 44785.65625 | 25.409 |
| 44785.666666666664 | 25.574 |
| 44785.677083333336 | 25.762 |
| 44785.6875 | 25.861 |
| 44785.697916666664 | 25.888 |
| 44785.708333333336 | 25.887 |
| 44785.71875 | 25.938 |
| 44785.729166666664 | 25.995 |
| 44785.739583333336 | 26.07 |
| 44785.75 | 26.147 |
| 44785.760416666664 | 26.298 |
| 44785.770833333336 | 26.342 |
| 44785.78125 | 26.498 |
| 44785.791666666664 | 26.611 |
| 44785.802083333336 | 26.717 |
| 44785.8125 | 26.768 |
| 44785.822916666664 | 26.751 |
| 44785.833333333336 | 26.7 |
| 44785.84375 | 26.772 |
| 44785.854166666664 | 26.765 |
| 44785.864583333336 | 26.711 |
| 44785.875 | 26.66 |
| 44785.885416666664 | 26.627 |
| 44785.895833333336 | 26.607 |
| 44785.90625 | 26.681 |
| 44785.916666666664 | 26.727 |
| 44785.927083333336 | 26.722 |
| 44785.9375 | 26.684 |
| 44785.947916666664 | 26.605 |
| 44785.958333333336 | 26.525 |
| 44785.96875 | 26.404 |
| 44785.979166666664 | 26.199 |
| 44785.989583333336 | 25.94 |
| 44786.0 | 25.698 |
| 44786.010416666664 | 25.441 |
| 44786.020833333336 | 25.281 |
| 44786.03125 | 25.255 |
| 44786.041666666664 | 25.346 |
| 44786.052083333336 | 25.443 |
| 44786.0625 | 25.445 |
| 44786.072916666664 | 25.407 |
| 44786.083333333336 | 25.363 |
| 44786.09375 | 25.302 |
| 44786.104166666664 | 25.194 |
| 44786.114583333336 | 25.39 |
| 44786.125 | 25.177 |
| 44786.135416666664 | 25.29 |
| 44786.145833333336 | 25.216 |
| 44786.15625 | 25.178 |
| 44786.166666666664 | 25.12 |
| 44786.177083333336 | 25.188 |
| 44786.1875 | 25.173 |
| 44786.197916666664 | 25.159 |
| 44786.208333333336 | 25.196 |
| 44786.21875 | 25.184 |
| 44786.229166666664 | 25.141 |
| 44786.239583333336 | 25.061 |
| 44786.25 | 24.903 |
| 44786.260416666664 | 24.884 |
| 44786.270833333336 | 24.826 |
| 44786.28125 | 24.852 |
| 44786.291666666664 | 24.86 |
| 44786.302083333336 | 24.857 |
| 44786.3125 | 24.891 |
| 44786.322916666664 | 24.88 |
| 44786.333333333336 | 24.879 |
| 44786.34375 | 24.876 |
| 44786.354166666664 | 24.88 |
| 44786.364583333336 | 24.893 |
| 44786.375 | 24.813 |
| 44786.385416666664 | 24.883 |
| 44786.395833333336 | 24.888 |
| 44786.40625 | 24.821 |
| 44786.416666666664 | 24.783 |
| 44786.427083333336 | 24.643 |
| 44786.4375 | 24.422 |
| 44786.447916666664 | 24.181 |
| 44786.458333333336 | 24.08 |
| 44786.46875 | 24.035 |
| 44786.479166666664 | 23.877 |
| 44786.489583333336 | 23.768 |
| 44786.5 | 23.722 |
| 44786.510416666664 | 23.668 |
| 44786.520833333336 | 23.619 |
| 44786.53125 | 23.626 |
| 44786.541666666664 | 23.596 |
| 44786.552083333336 | 23.571 |
| 44786.5625 | 23.516 |
| 44786.572916666664 | 23.503 |
| 44786.583333333336 | 23.502 |
| 44786.59375 | 23.521 |
| 44786.604166666664 | 23.573 |
| 44786.614583333336 | 23.891 |
| 44786.625 | 24.205 |
| 44786.635416666664 | 24.317 |
| 44786.645833333336 | 24.49 |
| 44786.65625 | 24.414 |
| 44786.666666666664 | 24.522 |
| 44786.677083333336 | 24.615 |
| 44786.6875 | 24.733 |
| 44786.697916666664 | 25.136 |
| 44786.708333333336 | 25.459 |
| 44786.71875 | 25.536 |
| 44786.729166666664 | 25.717 |
| 44786.739583333336 | 25.99 |
| 44786.75 | 26.206 |
| 44786.760416666664 | 26.22 |
| 44786.770833333336 | 26.566 |
| 44786.78125 | 26.882 |
| 44786.791666666664 | 27.131 |
| 44786.802083333336 | 27.193 |
| 44786.8125 | 27.346 |
| 44786.822916666664 | 27.421 |
| 44786.833333333336 | 27.601 |
| 44786.84375 | 27.565 |
| 44786.854166666664 | 27.656 |
| 44786.864583333336 | 27.64 |
| 44786.875 | 27.547 |
| 44786.885416666664 | 27.489 |
| 44786.895833333336 | 27.424 |
| 44786.90625 | 27.317 |
| 44786.916666666664 | 27.185 |
| 44786.927083333336 | 27.095 |
| 44786.9375 | 26.962 |
| 44786.947916666664 | 26.886 |
| 44786.958333333336 | 26.805 |
| 44786.96875 | 26.682 |
| 44786.979166666664 | 26.577 |
| 44786.989583333336 | 26.473 |
| 44787.0 | 26.371 |
| 44787.010416666664 | 26.259 |
| 44787.020833333336 | 26.083 |
| 44787.03125 | 25.881 |
| 44787.041666666664 | 25.664 |
| 44787.052083333336 | 25.517 |
| 44787.0625 | 25.406 |
| 44787.072916666664 | 25.346 |
| 44787.083333333336 | 25.376 |
| 44787.09375 | 25.421 |
| 44787.104166666664 | 25.479 |
| 44787.114583333336 | 25.494 |
| 44787.125 | 25.482 |
| 44787.135416666664 | 25.437 |
| 44787.145833333336 | 25.476 |
| 44787.15625 | 25.48 |
| 44787.166666666664 | 25.349 |
| 44787.177083333336 | 25.256 |
| 44787.1875 | 25.186 |
| 44787.197916666664 | 25.139 |
| 44787.208333333336 | 25.082 |
| 44787.21875 | 25.107 |
| 44787.229166666664 | 25.04 |
| 44787.239583333336 | 24.943 |
| 44787.25 | 24.93 |
| 44787.260416666664 | 24.806 |
| 44787.270833333336 | 24.738 |
| 44787.28125 | 24.682 |
| 44787.291666666664 | 24.768 |
| 44787.302083333336 | 24.808 |
| 44787.3125 | 24.793 |
| 44787.322916666664 | 24.802 |
| 44787.333333333336 | 24.938 |
| 44787.34375 | 24.923 |
| 44787.354166666664 | 25.039 |
| 44787.364583333336 | 25.021 |
| 44787.375 | 25.048 |
| 44787.385416666664 | 25.014 |
| 44787.395833333336 | 25.038 |
| 44787.40625 | 24.881 |
| 44787.416666666664 | 25.015 |
| 44787.427083333336 | 25.028 |
| 44787.4375 | 24.994 |
| 44787.447916666664 | 24.933 |
| 44787.458333333336 | 24.818 |
| 44787.46875 | 24.668 |
| 44787.479166666664 | 24.602 |
| 44787.489583333336 | 24.55 |
| 44787.5 | 24.481 |
| 44787.510416666664 | 24.393 |
| 44787.520833333336 | 24.349 |
| 44787.53125 | 24.331 |
| 44787.541666666664 | 24.315 |
| 44787.552083333336 | 24.322 |
| 44787.5625 | 24.339 |
| 44787.572916666664 | 24.325 |
| 44787.583333333336 | 24.286 |
| 44787.59375 | 24.24 |
| 44787.604166666664 | 24.239 |
| 44787.614583333336 | 24.258 |
| 44787.625 | 24.316 |
| 44787.635416666664 | 24.378 |
| 44787.645833333336 | 24.472 |
| 44787.65625 | 25.046 |
| 44787.666666666664 | 25.081 |
| 44787.677083333336 | 25.335 |
| 44787.6875 | 25.361 |
| 44787.697916666664 | 25.435 |
| 44787.708333333336 | 25.93 |
| 44787.71875 | 25.609 |
| 44787.729166666664 | 26.27 |
| 44787.739583333336 | 26.52 |
| 44787.75 | 26.463 |
| 44787.760416666664 | 26.566 |
| 44787.770833333336 | 26.72 |
| 44787.78125 | 27.014 |
| 44787.791666666664 | 26.977 |
| 44787.802083333336 | 27.146 |
| 44787.8125 | 27.416 |
| 44787.822916666664 | 27.526 |
| 44787.833333333336 | 27.634 |
| 44787.84375 | 27.737 |
| 44787.854166666664 | 27.797 |
| 44787.864583333336 | 27.921 |
| 44787.875 | 28.017 |
| 44787.885416666664 | 28.002 |
| 44787.895833333336 | 28.012 |
| 44787.90625 | 27.903 |
| 44787.916666666664 | 27.758 |
| 44787.927083333336 | 27.677 |
| 44787.9375 | 27.569 |
| 44787.947916666664 | 27.451 |
| 44787.958333333336 | 27.353 |
| 44787.96875 | 27.201 |
| 44787.979166666664 | 27.073 |
| 44787.989583333336 | 26.927 |
| 44788.0 | 26.81 |
| 44788.010416666664 | 26.707 |
| 44788.020833333336 | 26.613 |
| 44788.03125 | 26.501 |
| 44788.041666666664 | 26.396 |
| 44788.052083333336 | 26.307 |
| 44788.0625 | 26.149 |
| 44788.072916666664 | 25.975 |
| 44788.083333333336 | 25.827 |
| 44788.09375 | 25.68 |
| 44788.104166666664 | 25.549 |
| 44788.114583333336 | 25.465 |
| 44788.125 | 25.45 |
| 44788.135416666664 | 25.455 |
| 44788.145833333336 | 25.482 |
| 44788.15625 | 25.517 |
| 44788.166666666664 | 25.572 |
| 44788.177083333336 | 25.68 |
| 44788.1875 | 25.591 |
| 44788.197916666664 | 25.518 |
| 44788.208333333336 | 25.486 |
| 44788.21875 | 25.368 |
| 44788.229166666664 | 25.404 |
| 44788.239583333336 | 25.299 |
| 44788.25 | 25.182 |
| 44788.260416666664 | 25.143 |
| 44788.270833333336 | 25.176 |
| 44788.28125 | 25.069 |
| 44788.291666666664 | 25.079 |
| 44788.302083333336 | 25.022 |
| 44788.3125 | 25.045 |
| 44788.322916666664 | 25.058 |
| 44788.333333333336 | 25.045 |
| 44788.34375 | 25.142 |
| 44788.354166666664 | 25.135 |
| 44788.364583333336 | 25.279 |
| 44788.375 | 25.177 |
| 44788.385416666664 | 25.39 |
| 44788.395833333336 | 25.496 |
| 44788.40625 | 25.493 |
| 44788.416666666664 | 25.474 |
| 44788.427083333336 | 25.328 |
| 44788.4375 | 25.353 |
| 44788.447916666664 | 25.386 |
| 44788.458333333336 | 25.336 |
| 44788.46875 | 25.267 |
| 44788.479166666664 | 25.179 |
| 44788.489583333336 | 25.047 |
| 44788.5 | 24.943 |
| 44788.510416666664 | 24.866 |
| 44788.520833333336 | 24.817 |
| 44788.53125 | 24.733 |
| 44788.541666666664 | 24.694 |
| 44788.552083333336 | 24.676 |
| 44788.5625 | 24.671 |
| 44788.572916666664 | 24.682 |
| 44788.583333333336 | 24.728 |
| 44788.59375 | 24.77 |
| 44788.604166666664 | 24.786 |
| 44788.614583333336 | 24.79 |
| 44788.625 | 24.784 |
| 44788.635416666664 | 24.753 |
| 44788.645833333336 | 24.741 |
| 44788.65625 | 24.739 |
| 44788.666666666664 | 24.748 |
| 44788.677083333336 | 24.815 |
| 44788.6875 | 24.85 |
| 44788.697916666664 | 24.786 |
| 44788.708333333336 | 24.909 |
| 44788.71875 | 25.062 |
| 44788.729166666664 | 25.091 |
| 44788.739583333336 | 25.171 |
| 44788.75 | 25.177 |
| 44788.760416666664 | 25.253 |
| 44788.770833333336 | 25.399 |
| 44788.78125 | 25.441 |
| 44788.791666666664 | 25.533 |
| 44788.802083333336 | 25.543 |
| 44788.8125 | 25.622 |
| 44788.822916666664 | 25.519 |
| 44788.833333333336 | 25.458 |
| 44788.84375 | 25.441 |
| 44788.854166666664 | 25.491 |
| 44788.864583333336 | 25.541 |
| 44788.875 | 25.576 |
| 44788.885416666664 | 25.515 |
| 44788.895833333336 | 25.628 |
| 44788.90625 | 25.644 |
| 44788.916666666664 | 25.547 |
| 44788.927083333336 | 25.627 |
| 44788.9375 | 25.739 |
| 44788.947916666664 | 25.617 |
| 44788.958333333336 | 25.667 |
| 44788.96875 | 25.649 |
| 44788.979166666664 | 25.573 |
| 44788.989583333336 | 25.535 |
| 44789.0 | 25.392 |
| 44789.010416666664 | 25.258 |
| 44789.020833333336 | 25.173 |
| 44789.03125 | 25.12 |
| 44789.041666666664 | 25.065 |
| 44789.052083333336 | 24.98 |
| 44789.0625 | 24.906 |
| 44789.072916666664 | 24.862 |
| 44789.083333333336 | 24.807 |
| 44789.09375 | 24.739 |
| 44789.104166666664 | 24.69 |
| 44789.114583333336 | 24.627 |
| 44789.125 | 24.587 |
| 44789.135416666664 | 24.506 |
| 44789.145833333336 | 24.459 |
| 44789.15625 | 24.393 |
| 44789.166666666664 | 24.328 |
| 44789.177083333336 | 24.292 |
| 44789.1875 | 24.282 |
| 44789.197916666664 | 24.28 |
| 44789.208333333336 | 24.509 |
| 44789.21875 | 24.285 |
| 44789.229166666664 | 24.347 |
| 44789.239583333336 | 24.295 |
| 44789.25 | 24.174 |
| 44789.260416666664 | 24.166 |
| 44789.270833333336 | 24.134 |
| 44789.28125 | 23.974 |
| 44789.291666666664 | 24.061 |
| 44789.302083333336 | 24.068 |
| 44789.3125 | 23.857 |
| 44789.322916666664 | 23.765 |
| 44789.333333333336 | 23.814 |
| 44789.34375 | 23.666 |
| 44789.354166666664 | 23.656 |
| 44789.364583333336 | 23.667 |
| 44789.375 | 23.661 |
| 44789.385416666664 | 23.652 |
| 44789.395833333336 | 23.702 |
| 44789.40625 | 23.71 |
| 44789.416666666664 | 23.821 |
| 44789.427083333336 | 23.849 |
| 44789.4375 | 23.846 |
| 44789.447916666664 | 23.923 |
| 44789.458333333336 | 23.883 |
| 44789.46875 | 23.815 |
| 44789.479166666664 | 23.879 |
| 44789.489583333336 | 23.876 |
| 44789.5 | 23.817 |
| 44789.510416666664 | 23.807 |
| 44789.520833333336 | 23.778 |
| 44789.53125 | 23.719 |
| 44789.541666666664 | 23.681 |
| 44789.552083333336 | 23.696 |
| 44789.5625 | 23.648 |
| 44789.572916666664 | 23.638 |
| 44789.583333333336 | 23.636 |
| 44789.59375 | 23.652 |
| 44789.604166666664 | 23.693 |
| 44789.614583333336 | 23.744 |
| 44789.625 | 23.802 |
| 44789.635416666664 | 23.863 |
| 44789.645833333336 | 23.92 |
| 44789.65625 | 23.957 |
| 44789.666666666664 | 23.985 |
| 44789.677083333336 | 24.013 |
| 44789.6875 | 24.05 |
| 44789.697916666664 | 24.089 |
| 44789.708333333336 | 24.376 |
| 44789.71875 | 24.535 |
| 44789.729166666664 | 24.943 |
| 44789.739583333336 | 25.124 |
| 44789.75 | 25.412 |
| 44789.760416666664 | 25.175 |
| 44789.770833333336 | 25.655 |
| 44789.78125 | 25.42 |
| 44789.791666666664 | 25.655 |
| 44789.802083333336 | 25.481 |
| 44789.8125 | 25.867 |
| 44789.822916666664 | 26.17 |
| 44789.833333333336 | 26.044 |
| 44789.84375 | 26.516 |
| 44789.854166666664 | 26.532 |
| 44789.864583333336 | 26.887 |
| 44789.875 | 26.795 |
| 44789.885416666664 | 26.682 |
| 44789.895833333336 | 26.877 |
| 44789.90625 | 26.801 |
| 44789.916666666664 | 26.778 |
| 44789.927083333336 | 26.953 |
| 44789.9375 | 26.798 |
| 44789.947916666664 | 26.741 |
| 44789.958333333336 | 26.622 |
| 44789.96875 | 26.545 |
| 44789.979166666664 | 26.466 |
| 44789.989583333336 | 26.46 |
| 44790.0 | 26.404 |
| 44790.010416666664 | 26.369 |
| 44790.020833333336 | 26.284 |
| 44790.03125 | 26.164 |
| 44790.041666666664 | 26.109 |
| 44790.052083333336 | 25.917 |
| 44790.0625 | 25.71 |
| 44790.072916666664 | 25.561 |
| 44790.083333333336 | 25.443 |
| 44790.09375 | 25.355 |
| 44790.104166666664 | 25.266 |
| 44790.114583333336 | 25.229 |
| 44790.125 | 25.196 |
| 44790.135416666664 | 25.18 |
| 44790.145833333336 | 25.131 |
| 44790.15625 | 25.049 |
| 44790.166666666664 | 24.933 |
| 44790.177083333336 | 24.854 |
| 44790.1875 | 24.741 |
| 44790.197916666664 | 24.685 |
| 44790.208333333336 | 24.618 |
| 44790.21875 | 24.534 |
| 44790.229166666664 | 24.47 |
| 44790.239583333336 | 24.881 |
| 44790.25 | 24.695 |
| 44790.260416666664 | 24.673 |
| 44790.270833333336 | 24.619 |
| 44790.28125 | 24.566 |
| 44790.291666666664 | 24.439 |
| 44790.302083333336 | 24.415 |
| 44790.3125 | 24.268 |
| 44790.322916666664 | 24.28 |
| 44790.333333333336 | 24.137 |
| 44790.34375 | 24.155 |
| 44790.354166666664 | 23.939 |
| 44790.364583333336 | 23.94 |
| 44790.375 | 23.821 |
| 44790.385416666664 | 23.783 |
| 44790.395833333336 | 23.802 |
| 44790.40625 | 23.626 |
| 44790.416666666664 | 23.693 |
| 44790.427083333336 | 23.593 |
| 44790.4375 | 23.57 |
| 44790.447916666664 | 23.625 |
| 44790.458333333336 | 23.583 |
| 44790.46875 | 23.577 |
| 44790.479166666664 | 23.589 |
| 44790.489583333336 | 23.605 |
| 44790.5 | 23.633 |
| 44790.510416666664 | 23.642 |
| 44790.520833333336 | 23.657 |
| 44790.53125 | 23.692 |
| 44790.541666666664 | 23.687 |
| 44790.552083333336 | 23.698 |
| 44790.5625 | 23.699 |
| 44790.572916666664 | 23.668 |
| 44790.583333333336 | 23.713 |
| 44790.59375 | 23.753 |
| 44790.604166666664 | 23.788 |
| 44790.614583333336 | 23.847 |
| 44790.625 | 23.902 |
| 44790.635416666664 | 23.969 |
| 44790.645833333336 | 24.04 |
| 44790.65625 | 24.112 |
| 44790.666666666664 | 24.175 |
| 44790.677083333336 | 24.24 |
| 44790.6875 | 24.295 |
| 44790.697916666664 | 24.357 |
| 44790.708333333336 | 24.436 |
| 44790.71875 | 24.491 |
| 44790.729166666664 | 24.554 |
| 44790.739583333336 | 24.58 |
| 44790.75 | 24.626 |
| 44790.760416666664 | 24.815 |
| 44790.770833333336 | 25.163 |
| 44790.78125 | 25.549 |
| 44790.791666666664 | 25.828 |
| 44790.802083333336 | 25.919 |
| 44790.8125 | 25.793 |
| 44790.822916666664 | 25.717 |
| 44790.833333333336 | 25.625 |
| 44790.84375 | 25.778 |
| 44790.854166666664 | 26.157 |
| 44790.864583333336 | 26.214 |
| 44790.875 | 26.143 |
| 44790.885416666664 | 26.461 |
| 44790.895833333336 | 26.354 |
| 44790.90625 | 26.48 |
| 44790.916666666664 | 26.757 |
| 44790.927083333336 | 26.628 |
| 44790.9375 | 26.598 |
| 44790.947916666664 | 26.598 |
| 44790.958333333336 | 26.516 |
| 44790.96875 | 26.526 |
| 44790.979166666664 | 26.576 |
| 44790.989583333336 | 26.539 |
| 44791.0 | 26.427 |
| 44791.010416666664 | 26.362 |
| 44791.020833333336 | 26.309 |
| 44791.03125 | 26.275 |
| 44791.041666666664 | 26.253 |
| 44791.052083333336 | 26.254 |
| 44791.0625 | 26.17 |
| 44791.072916666664 | 26.092 |
| 44791.083333333336 | 25.994 |
| 44791.09375 | 25.874 |
| 44791.104166666664 | 25.675 |
| 44791.114583333336 | 25.381 |
| 44791.125 | 25.285 |
| 44791.135416666664 | 25.297 |
| 44791.145833333336 | 25.32 |
| 44791.15625 | 25.328 |
| 44791.166666666664 | 25.32 |
| 44791.177083333336 | 25.29 |
| 44791.1875 | 25.25 |
| 44791.197916666664 | 25.213 |
| 44791.208333333336 | 25.174 |
| 44791.21875 | 25.133 |
| 44791.229166666664 | 25.105 |
| 44791.239583333336 | 25.08 |
| 44791.25 | 25.065 |
| 44791.260416666664 | 25.137 |
| 44791.270833333336 | 25.071 |
| 44791.28125 | 24.963 |
| 44791.291666666664 | 24.84 |
| 44791.302083333336 | 24.777 |
| 44791.3125 | 24.671 |
| 44791.322916666664 | 24.609 |
| 44791.333333333336 | 24.464 |
| 44791.34375 | 24.464 |
| 44791.354166666664 | 24.407 |
| 44791.364583333336 | 24.284 |
| 44791.375 | 24.206 |
| 44791.385416666664 | 24.119 |
| 44791.395833333336 | 23.972 |
| 44791.40625 | 24.126 |
| 44791.416666666664 | 23.963 |
| 44791.427083333336 | 23.961 |
| 44791.4375 | 23.883 |
| 44791.447916666664 | 24.014 |
| 44791.458333333336 | 23.799 |
| 44791.46875 | 23.829 |
| 44791.479166666664 | 23.841 |
| 44791.489583333336 | 23.903 |
| 44791.5 | 23.897 |
| 44791.510416666664 | 23.935 |
| 44791.520833333336 | 23.986 |
| 44791.53125 | 23.987 |
| 44791.541666666664 | 24.008 |
| 44791.552083333336 | 24.035 |
| 44791.5625 | 24.061 |
| 44791.572916666664 | 24.055 |
| 44791.583333333336 | 24.127 |
| 44791.59375 | 24.221 |
| 44791.604166666664 | 24.322 |
| 44791.614583333336 | 24.448 |
| 44791.625 | 24.532 |
| 44791.635416666664 | 24.645 |
| 44791.645833333336 | 24.736 |
| 44791.65625 | 24.853 |
| 44791.666666666664 | 24.96 |
| 44791.677083333336 | 25.094 |
| 44791.6875 | 25.224 |
| 44791.697916666664 | 25.325 |
| 44791.708333333336 | 25.432 |
| 44791.71875 | 25.507 |
| 44791.729166666664 | 25.573 |
| 44791.739583333336 | 25.647 |
| 44791.75 | 25.736 |
| 44791.760416666664 | 25.803 |
| 44791.770833333336 | 25.872 |
| 44791.78125 | 25.92 |
| 44791.791666666664 | 26.251 |
| 44791.802083333336 | 26.263 |
| 44791.8125 | 26.663 |
| 44791.822916666664 | 26.833 |
| 44791.833333333336 | 26.732 |
| 44791.84375 | 26.995 |
| 44791.854166666664 | 27.324 |
| 44791.864583333336 | 27.606 |
| 44791.875 | 27.837 |
| 44791.885416666664 | 28.099 |
| 44791.895833333336 | 28.485 |
| 44791.90625 | 28.326 |
| 44791.916666666664 | 28.386 |
| 44791.927083333336 | 27.949 |
| 44791.9375 | 27.728 |
| 44791.947916666664 | 27.691 |
| 44791.958333333336 | 27.696 |
| 44791.96875 | 27.768 |
| 44791.979166666664 | 27.899 |
| 44791.989583333336 | 27.869 |
| 44792.0 | 27.731 |
| 44792.010416666664 | 27.612 |
| 44792.020833333336 | 27.503 |
| 44792.03125 | 27.436 |
| 44792.041666666664 | 27.387 |
| 44792.052083333336 | 27.399 |
| 44792.0625 | 27.391 |
| 44792.072916666664 | 27.415 |
| 44792.083333333336 | 27.374 |
| 44792.09375 | 27.325 |
| 44792.104166666664 | 27.215 |
| 44792.114583333336 | 27.101 |
| 44792.125 | 26.924 |
| 44792.135416666664 | 26.594 |
| 44792.145833333336 | 26.483 |
| 44792.15625 | 26.454 |
| 44792.166666666664 | 26.432 |
| 44792.177083333336 | 26.398 |
| 44792.1875 | 26.367 |
| 44792.197916666664 | 26.309 |
| 44792.208333333336 | 26.236 |
| 44792.21875 | 26.153 |
| 44792.229166666664 | 26.048 |
| 44792.239583333336 | 25.961 |
| 44792.25 | 25.892 |
| 44792.260416666664 | 25.819 |
| 44792.270833333336 | 25.773 |
| 44792.28125 | 25.721 |
| 44792.291666666664 | 25.78 |
| 44792.302083333336 | 25.851 |
| 44792.3125 | 25.754 |
| 44792.322916666664 | 25.591 |
| 44792.333333333336 | 25.389 |
| 44792.34375 | 25.431 |
| 44792.354166666664 | 25.263 |
| 44792.364583333336 | 25.23 |
| 44792.375 | 25.283 |
| 44792.385416666664 | 25.146 |
| 44792.395833333336 | 25.152 |
| 44792.40625 | 25.143 |
| 44792.416666666664 | 25.128 |
| 44792.427083333336 | 25.133 |
| 44792.4375 | 25.124 |
| 44792.447916666664 | 25.066 |
| 44792.458333333336 | 25.042 |
| 44792.46875 | 24.971 |
| 44792.479166666664 | 24.992 |
| 44792.489583333336 | 24.972 |
| 44792.5 | 24.964 |
| 44792.510416666664 | 25.024 |
| 44792.520833333336 | 25.052 |
| 44792.53125 | 25.114 |
| 44792.541666666664 | 25.07 |
| 44792.552083333336 | 25.135 |
| 44792.5625 | 25.155 |
| 44792.572916666664 | 25.182 |
| 44792.583333333336 | 25.232 |
| 44792.59375 | 25.26 |
| 44792.604166666664 | 25.332 |
| 44792.614583333336 | 25.443 |
| 44792.625 | 25.497 |
| 44792.635416666664 | 25.626 |
| 44792.645833333336 | 25.758 |
| 44792.65625 | 25.905 |
| 44792.666666666664 | 26.102 |
| 44792.677083333336 | 26.253 |
| 44792.6875 | 26.378 |
| 44792.697916666664 | 26.507 |
| 44792.708333333336 | 26.584 |
| 44792.71875 | 26.615 |
| 44792.729166666664 | 26.641 |
| 44792.739583333336 | 26.669 |
| 44792.75 | 26.652 |
| 44792.760416666664 | 26.662 |
| 44792.770833333336 | 26.661 |
| 44792.78125 | 26.584 |
| 44792.791666666664 | 26.589 |
| 44792.802083333336 | 26.571 |
| 44792.8125 | 26.627 |
| 44792.822916666664 | 26.647 |
| 44792.833333333336 | 26.779 |
| 44792.84375 | 26.728 |
| 44792.854166666664 | 26.817 |
| 44792.864583333336 | 27.321 |
| 44792.875 | 27.491 |
| 44792.885416666664 | 27.502 |
| 44792.895833333336 | 27.786 |
| 44792.90625 | 27.619 |
| 44792.916666666664 | 27.598 |
| 44792.927083333336 | 27.775 |
| 44792.9375 | 27.753 |
| 44792.947916666664 | 27.628 |
| 44792.958333333336 | 27.751 |
| 44792.96875 | 27.805 |
| 44792.979166666664 | 27.853 |
| 44792.989583333336 | 27.868 |
| 44793.0 | 27.717 |
| 44793.010416666664 | 27.66 |
| 44793.020833333336 | 27.656 |
| 44793.03125 | 27.636 |
| 44793.041666666664 | 27.56 |
| 44793.052083333336 | 27.495 |
| 44793.0625 | 27.442 |
| 44793.072916666664 | 27.395 |
| 44793.083333333336 | 27.38 |
| 44793.09375 | 27.367 |
| 44793.104166666664 | 27.383 |
| 44793.114583333336 | 27.335 |
| 44793.125 | 27.374 |
| 44793.135416666664 | 27.361 |
| 44793.145833333336 | 27.32 |
| 44793.15625 | 27.243 |
| 44793.166666666664 | 27.185 |
| 44793.177083333336 | 26.986 |
| 44793.1875 | 26.879 |
| 44793.197916666664 | 26.775 |
| 44793.208333333336 | 26.712 |
| 44793.21875 | 26.641 |
| 44793.229166666664 | 26.591 |
| 44793.239583333336 | 26.534 |
| 44793.25 | 26.506 |
| 44793.260416666664 | 26.48 |
| 44793.270833333336 | 26.458 |
| 44793.28125 | 26.435 |
| 44793.291666666664 | 26.41 |
| 44793.302083333336 | 26.391 |
| 44793.3125 | 26.372 |
| 44793.322916666664 | 26.341 |
| 44793.333333333336 | 26.422 |
| 44793.34375 | 26.423 |
| 44793.354166666664 | 26.338 |
| 44793.364583333336 | 26.18 |
| 44793.375 | 26.159 |
| 44793.385416666664 | 26.061 |
| 44793.395833333336 | 26.042 |
| 44793.40625 | 25.966 |
| 44793.416666666664 | 26.084 |
| 44793.427083333336 | 26 |
| 44793.4375 | 25.919 |
| 44793.447916666664 | 25.991 |
| 44793.458333333336 | 25.918 |
| 44793.46875 | 25.954 |
| 44793.479166666664 | 25.927 |
| 44793.489583333336 | 25.875 |
| 44793.5 | 25.836 |
| 44793.510416666664 | 25.86 |
| 44793.520833333336 | 25.853 |
| 44793.53125 | 25.921 |
| 44793.541666666664 | 25.894 |
| 44793.552083333336 | 25.915 |
| 44793.5625 | 25.946 |
| 44793.572916666664 | 25.958 |
| 44793.583333333336 | 26.053 |
| 44793.59375 | 26.208 |
| 44793.604166666664 | 26.133 |
| 44793.614583333336 | 26.204 |
| 44793.625 | 26.228 |
| 44793.635416666664 | 26.349 |
| 44793.645833333336 | 26.504 |
| 44793.65625 | 26.562 |
| 44793.666666666664 | 26.735 |
| 44793.677083333336 | 26.78 |
| 44793.6875 | 26.864 |
| 44793.697916666664 | 26.979 |
| 44793.708333333336 | 27.075 |
| 44793.71875 | 27.198 |
| 44793.729166666664 | 27.317 |
| 44793.739583333336 | 27.418 |
| 44793.75 | 27.505 |
| 44793.760416666664 | 27.534 |
| 44793.770833333336 | 27.604 |
| 44793.78125 | 27.654 |
| 44793.791666666664 | 27.716 |
| 44793.802083333336 | 27.746 |
| 44793.8125 | 27.762 |
| 44793.822916666664 | 27.794 |
| 44793.833333333336 | 27.8 |
| 44793.84375 | 27.772 |
| 44793.854166666664 | 28.109 |
| 44793.864583333336 | 27.872 |
| 44793.875 | 28.42 |
| 44793.885416666664 | 28.109 |
| 44793.895833333336 | 28.818 |
| 44793.90625 | 29.101 |
| 44793.916666666664 | 29.394 |
| 44793.927083333336 | 29.198 |
| 44793.9375 | 29.02 |
| 44793.947916666664 | 29.079 |
| 44793.958333333336 | 29.296 |
| 44793.96875 | 29.358 |
| 44793.979166666664 | 29.169 |
| 44793.989583333336 | 28.942 |
| 44794.0 | 29.151 |
| 44794.010416666664 | 29.309 |
| 44794.020833333336 | 29.338 |
| 44794.03125 | 29.358 |
| 44794.041666666664 | 29.262 |
| 44794.052083333336 | 29.229 |
| 44794.0625 | 29.15 |
| 44794.072916666664 | 29.051 |
| 44794.083333333336 | 28.991 |
| 44794.09375 | 28.88 |
| 44794.104166666664 | 28.823 |
| 44794.114583333336 | 28.784 |
| 44794.125 | 28.768 |
| 44794.135416666664 | 28.822 |
| 44794.145833333336 | 28.786 |
| 44794.15625 | 28.822 |
| 44794.166666666664 | 28.811 |
| 44794.177083333336 | 28.806 |
| 44794.1875 | 28.774 |
| 44794.197916666664 | 28.694 |
| 44794.208333333336 | 28.66 |
| 44794.21875 | 28.5 |
| 44794.229166666664 | 28.217 |
| 44794.239583333336 | 28.087 |
| 44794.25 | 28.026 |
| 44794.260416666664 | 27.92 |
| 44794.270833333336 | 27.83 |
| 44794.28125 | 27.787 |
| 44794.291666666664 | 27.747 |
| 44794.302083333336 | 27.702 |
| 44794.3125 | 27.678 |
| 44794.322916666664 | 27.65 |
| 44794.333333333336 | 27.623 |
| 44794.34375 | 27.594 |
| 44794.354166666664 | 27.554 |
| 44794.364583333336 | 27.535 |
| 44794.375 | 27.681 |
| 44794.385416666664 | 27.542 |
| 44794.395833333336 | 27.514 |
| 44794.40625 | 27.426 |
| 44794.416666666664 | 27.274 |
| 44794.427083333336 | 27.19 |
| 44794.4375 | 27.159 |
| 44794.447916666664 | 27.174 |
| 44794.458333333336 | 27.093 |
| 44794.46875 | 27.236 |
| 44794.479166666664 | 27.021 |
| 44794.489583333336 | 26.946 |
| 44794.5 | 26.899 |
| 44794.510416666664 | 26.904 |
| 44794.520833333336 | 26.931 |
| 44794.53125 | 26.909 |
| 44794.541666666664 | 26.922 |
| 44794.552083333336 | 26.875 |
| 44794.5625 | 26.932 |
| 44794.572916666664 | 26.902 |
| 44794.583333333336 | 26.964 |
| 44794.59375 | 27.139 |
| 44794.604166666664 | 27.17 |
| 44794.614583333336 | 27.272 |
| 44794.625 | 27.362 |
| 44794.635416666664 | 27.403 |
| 44794.645833333336 | 27.326 |
| 44794.65625 | 27.311 |
| 44794.666666666664 | 27.316 |
| 44794.677083333336 | 27.361 |
| 44794.6875 | 27.415 |
| 44794.697916666664 | 27.501 |
| 44794.708333333336 | 27.547 |
| 44794.71875 | 27.629 |
| 44794.729166666664 | 27.74 |
| 44794.739583333336 | 27.806 |
| 44794.75 | 27.893 |
| 44794.760416666664 | 27.951 |
| 44794.770833333336 | 28.059 |
| 44794.78125 | 28.116 |
| 44794.791666666664 | 28.152 |
| 44794.802083333336 | 28.245 |
| 44794.8125 | 28.282 |
| 44794.822916666664 | 28.316 |
| 44794.833333333336 | 28.334 |
| 44794.84375 | 28.351 |
| 44794.854166666664 | 28.254 |
| 44794.864583333336 | 28.327 |
| 44794.875 | 28.321 |
| 44794.885416666664 | 28.284 |
| 44794.895833333336 | 28.29 |
| 44794.90625 | 28.273 |
| 44794.916666666664 | 28.343 |
| 44794.927083333336 | 28.372 |
| 44794.9375 | 28.145 |
| 44794.947916666664 | 28.026 |
| 44794.958333333336 | 28.485 |
| 44794.96875 | 28.493 |
| 44794.979166666664 | 28.654 |
| 44794.989583333336 | 28.586 |
| 44795.0 | 28.55 |
| 44795.010416666664 | 28.466 |
| 44795.020833333336 | 28.516 |
| 44795.03125 | 28.416 |
| 44795.041666666664 | 28.389 |
| 44795.052083333336 | 28.342 |
| 44795.0625 | 28.259 |
| 44795.072916666664 | 28.246 |
| 44795.083333333336 | 28.229 |
| 44795.09375 | 28.232 |
| 44795.104166666664 | 28.232 |
| 44795.114583333336 | 28.209 |
| 44795.125 | 28.209 |
| 44795.135416666664 | 28.145 |
| 44795.145833333336 | 28.153 |
| 44795.15625 | 28.122 |
| 44795.166666666664 | 28.112 |
| 44795.177083333336 | 28.117 |
| 44795.1875 | 28.121 |
| 44795.197916666664 | 28.096 |
| 44795.208333333336 | 28.02 |
| 44795.21875 | 27.959 |
| 44795.229166666664 | 27.949 |
| 44795.239583333336 | 27.875 |
| 44795.25 | 27.75 |
| 44795.260416666664 | 27.65 |
| 44795.270833333336 | 27.613 |
| 44795.28125 | 27.622 |
| 44795.291666666664 | 27.617 |
| 44795.302083333336 | 27.623 |
| 44795.3125 | 27.621 |
| 44795.322916666664 | 27.606 |
| 44795.333333333336 | 27.561 |
| 44795.34375 | 27.53 |
| 44795.354166666664 | 27.49 |
| 44795.364583333336 | 27.46 |
| 44795.375 | 27.424 |
| 44795.385416666664 | 27.385 |
| 44795.395833333336 | 27.356 |
| 44795.40625 | 27.334 |
| 44795.416666666664 | 27.351 |
| 44795.427083333336 | 27.284 |
| 44795.4375 | 27.199 |
| 44795.447916666664 | 27.082 |
| 44795.458333333336 | 27.038 |
| 44795.46875 | 27.05 |
| 44795.479166666664 | 27.019 |
| 44795.489583333336 | 27.115 |
| 44795.5 | 26.91 |
| 44795.510416666664 | 26.874 |
| 44795.520833333336 | 26.806 |
| 44795.53125 | 26.73 |
| 44795.541666666664 | 26.683 |
| 44795.552083333336 | 26.751 |
| 44795.5625 | 26.72 |
| 44795.572916666664 | 26.705 |
| 44795.583333333336 | 26.628 |
| 44795.59375 | 26.696 |
| 44795.604166666664 | 26.708 |
| 44795.614583333336 | 26.775 |
| 44795.625 | 26.81 |
| 44795.635416666664 | 26.813 |
| 44795.645833333336 | 26.852 |
| 44795.65625 | 26.968 |
| 44795.666666666664 | 26.998 |
| 44795.677083333336 | 27.021 |
| 44795.6875 | 27.024 |
| 44795.697916666664 | 27.054 |
| 44795.708333333336 | 27.091 |
| 44795.71875 | 27.171 |
| 44795.729166666664 | 27.308 |
| 44795.739583333336 | 27.411 |
| 44795.75 | 27.564 |
| 44795.760416666664 | 27.712 |
| 44795.770833333336 | 27.792 |
| 44795.78125 | 27.886 |
| 44795.791666666664 | 27.954 |
| 44795.802083333336 | 28 |
| 44795.8125 | 28.038 |
| 44795.822916666664 | 28.058 |
| 44795.833333333336 | 28.107 |
| 44795.84375 | 28.114 |
| 44795.854166666664 | 28.125 |
| 44795.864583333336 | 28.128 |
| 44795.875 | 28.152 |
| 44795.885416666664 | 28.171 |
| 44795.895833333336 | 28.184 |
| 44795.90625 | 28.182 |
| 44795.916666666664 | 28.156 |
| 44795.927083333336 | 28.103 |
| 44795.9375 | 28.018 |
| 44795.947916666664 | 28.042 |
| 44795.958333333336 | 28.075 |
| 44795.96875 | 28.009 |
| 44795.979166666664 | 28.005 |
| 44795.989583333336 | 28.092 |
| 44796.0 | 28.164 |
| 44796.010416666664 | 28.166 |
| 44796.020833333336 | 28.21 |
| 44796.03125 | 28.264 |
| 44796.041666666664 | 28.258 |
| 44796.052083333336 | 28.258 |
| 44796.0625 | 28.356 |
| 44796.072916666664 | 28.329 |
| 44796.083333333336 | 28.252 |
| 44796.09375 | 28.221 |
| 44796.104166666664 | 28.162 |
| 44796.114583333336 | 28.155 |
| 44796.125 | 28.134 |
| 44796.135416666664 | 28.135 |
| 44796.145833333336 | 28.083 |
| 44796.15625 | 28.07 |
| 44796.166666666664 | 28.056 |
| 44796.177083333336 | 28.044 |
| 44796.1875 | 28.041 |
| 44796.197916666664 | 28.027 |
| 44796.208333333336 | 28.016 |
| 44796.21875 | 27.976 |
| 44796.229166666664 | 27.98 |
| 44796.239583333336 | 27.981 |
| 44796.25 | 27.981 |
| 44796.260416666664 | 27.963 |
| 44796.270833333336 | 27.912 |
| 44796.28125 | 27.86 |
| 44796.291666666664 | 27.82 |
| 44796.302083333336 | 27.73 |
| 44796.3125 | 27.56 |
| 44796.322916666664 | 27.45 |
| 44796.333333333336 | 27.378 |
| 44796.34375 | 27.38 |
| 44796.354166666664 | 27.351 |
| 44796.364583333336 | 27.328 |
| 44796.375 | 27.304 |
| 44796.385416666664 | 27.285 |
| 44796.395833333336 | 27.264 |
| 44796.40625 | 27.242 |
| 44796.416666666664 | 27.223 |
| 44796.427083333336 | 27.194 |
| 44796.4375 | 27.178 |
| 44796.447916666664 | 27.163 |
| 44796.458333333336 | 27.232 |
| 44796.46875 | 27.156 |
| 44796.479166666664 | 27.105 |
| 44796.489583333336 | 27.066 |
| 44796.5 | 27.014 |
| 44796.510416666664 | 26.946 |
| 44796.520833333336 | 26.73 |
| 44796.53125 | 26.833 |
| 44796.541666666664 | 26.794 |
| 44796.552083333336 | 26.85 |
| 44796.5625 | 27.021 |
| 44796.572916666664 | 26.895 |
| 44796.583333333336 | 27.015 |
| 44796.59375 | 27.144 |
| 44796.604166666664 | 27.239 |
| 44796.614583333336 | 27.257 |
| 44796.625 | 27.321 |
| 44796.635416666664 | 27.394 |
| 44796.645833333336 | 27.52 |
| 44796.65625 | 27.832 |
| 44796.666666666664 | 27.846 |
| 44796.677083333336 | 27.942 |
| 44796.6875 | 28.05 |
| 44796.697916666664 | 27.995 |
| 44796.708333333336 | 28.199 |
| 44796.71875 | 28.074 |
| 44796.729166666664 | 28.033 |
| 44796.739583333336 | 28.001 |
| 44796.75 | 28.023 |
| 44796.760416666664 | 28.193 |
| 44796.770833333336 | 28.21 |
| 44796.78125 | 28.434 |
| 44796.791666666664 | 28.531 |
| 44796.802083333336 | 28.711 |
| 44796.8125 | 28.802 |
| 44796.822916666664 | 28.885 |
| 44796.833333333336 | 28.993 |
| 44796.84375 | 29.09 |
| 44796.854166666664 | 29.181 |
| 44796.864583333336 | 29.264 |
| 44796.875 | 29.297 |
| 44796.885416666664 | 29.323 |
| 44796.895833333336 | 29.328 |
| 44796.90625 | 29.289 |
| 44796.916666666664 | 29.212 |
| 44796.927083333336 | 29.118 |
| 44796.9375 | 29.012 |
| 44796.947916666664 | 28.974 |
| 44796.958333333336 | 28.913 |
| 44796.96875 | 28.808 |
| 44796.979166666664 | 28.806 |
| 44796.989583333336 | 28.915 |
| 44797.0 | 28.632 |
| 44797.010416666664 | 28.672 |
| 44797.020833333336 | 28.945 |
| 44797.03125 | 28.905 |
| 44797.041666666664 | 28.987 |
| 44797.052083333336 | 28.912 |
| 44797.0625 | 28.894 |
| 44797.072916666664 | 28.932 |
| 44797.083333333336 | 28.887 |
| 44797.09375 | 28.936 |
| 44797.104166666664 | 28.897 |
| 44797.114583333336 | 28.866 |
| 44797.125 | 28.844 |
| 44797.135416666664 | 28.871 |
| 44797.145833333336 | 28.839 |
| 44797.15625 | 28.877 |
| 44797.166666666664 | 28.868 |
| 44797.177083333336 | 28.87 |
| 44797.1875 | 28.851 |
| 44797.197916666664 | 28.813 |
| 44797.208333333336 | 28.776 |
| 44797.21875 | 28.749 |
| 44797.229166666664 | 28.74 |
| 44797.239583333336 | 28.726 |
| 44797.25 | 28.687 |
| 44797.260416666664 | 28.644 |
| 44797.270833333336 | 28.635 |
| 44797.28125 | 28.615 |
| 44797.291666666664 | 28.632 |
| 44797.302083333336 | 28.617 |
| 44797.3125 | 28.544 |
| 44797.322916666664 | 28.502 |
| 44797.333333333336 | 28.374 |
| 44797.34375 | 28.106 |
| 44797.354166666664 | 27.934 |
| 44797.364583333336 | 27.861 |
| 44797.375 | 27.847 |
| 44797.385416666664 | 27.821 |
| 44797.395833333336 | 27.794 |
| 44797.40625 | 27.751 |
| 44797.416666666664 | 27.728 |
| 44797.427083333336 | 27.718 |
| 44797.4375 | 27.697 |
| 44797.447916666664 | 27.684 |
| 44797.458333333336 | 27.671 |
| 44797.46875 | 27.667 |
| 44797.479166666664 | 27.663 |
| 44797.489583333336 | 27.72 |
| 44797.5 | 27.638 |
| 44797.510416666664 | 27.602 |
| 44797.520833333336 | 27.499 |
| 44797.53125 | 27.347 |
| 44797.541666666664 | 27.349 |
| 44797.552083333336 | 27.416 |
| 44797.5625 | 27.434 |
| 44797.572916666664 | 27.477 |
| 44797.583333333336 | 27.609 |
| 44797.59375 | 27.515 |
| 44797.604166666664 | 27.599 |
| 44797.614583333336 | 27.822 |
| 44797.625 | 27.874 |
| 44797.635416666664 | 28.042 |
| 44797.645833333336 | 28.176 |
| 44797.65625 | 28.223 |
| 44797.666666666664 | 28.494 |
| 44797.677083333336 | 28.55 |
| 44797.6875 | 28.713 |
| 44797.697916666664 | 28.758 |
| 44797.708333333336 | 28.89 |
| 44797.71875 | 28.998 |
| 44797.729166666664 | 28.929 |
| 44797.739583333336 | 28.901 |
| 44797.75 | 28.885 |
| 44797.760416666664 | 28.752 |
| 44797.770833333336 | 28.708 |
| 44797.78125 | 28.695 |
| 44797.791666666664 | 28.698 |
| 44797.802083333336 | 28.748 |
| 44797.8125 | 28.759 |
| 44797.822916666664 | 28.854 |
| 44797.833333333336 | 28.994 |
| 44797.84375 | 29.098 |
| 44797.854166666664 | 29.206 |
| 44797.864583333336 | 29.285 |
| 44797.875 | 29.361 |
| 44797.885416666664 | 29.417 |
| 44797.895833333336 | 29.45 |
| 44797.90625 | 29.479 |
| 44797.916666666664 | 29.468 |
| 44797.927083333336 | 29.417 |
| 44797.9375 | 29.327 |
| 44797.947916666664 | 29.197 |
| 44797.958333333336 | 29.077 |
| 44797.96875 | 28.938 |
| 44797.979166666664 | 28.825 |
| 44797.989583333336 | 28.785 |
| 44798.0 | 28.745 |
| 44798.010416666664 | 28.771 |
| 44798.020833333336 | 28.87 |
| 44798.03125 | 28.762 |
| 44798.041666666664 | 28.758 |
| 44798.052083333336 | 28.752 |
| 44798.0625 | 28.715 |
| 44798.072916666664 | 28.705 |
| 44798.083333333336 | 28.65 |
| 44798.09375 | 28.681 |
| 44798.104166666664 | 28.58 |
| 44798.114583333336 | 28.58 |
| 44798.125 | 28.577 |
| 44798.135416666664 | 28.613 |
| 44798.145833333336 | 28.485 |
| 44798.15625 | 28.517 |
| 44798.166666666664 | 28.495 |
| 44798.177083333336 | 28.454 |
| 44798.1875 | 28.484 |
| 44798.197916666664 | 28.452 |
| 44798.208333333336 | 28.426 |
| 44798.21875 | 28.409 |
| 44798.229166666664 | 28.413 |
| 44798.239583333336 | 28.375 |
| 44798.25 | 28.366 |
| 44798.260416666664 | 28.326 |
| 44798.270833333336 | 28.323 |
| 44798.28125 | 28.266 |
| 44798.291666666664 | 28.238 |
| 44798.302083333336 | 28.251 |
| 44798.3125 | 28.259 |
| 44798.322916666664 | 28.252 |
| 44798.333333333336 | 28.191 |
| 44798.34375 | 28.114 |
| 44798.354166666664 | 28.005 |
| 44798.364583333336 | 27.816 |
| 44798.375 | 27.731 |
| 44798.385416666664 | 27.641 |
| 44798.395833333336 | 27.575 |
| 44798.40625 | 27.515 |
| 44798.416666666664 | 27.472 |
| 44798.427083333336 | 27.454 |
| 44798.4375 | 27.446 |
| 44798.447916666664 | 27.416 |
| 44798.458333333336 | 27.391 |
| 44798.46875 | 27.373 |
| 44798.479166666664 | 27.355 |
| 44798.489583333336 | 27.334 |
| 44798.5 | 27.334 |
| 44798.510416666664 | 27.403 |
| 44798.520833333336 | 27.497 |
| 44798.53125 | 27.452 |
| 44798.541666666664 | 27.464 |
| 44798.552083333336 | 27.443 |
| 44798.5625 | 27.42 |
| 44798.572916666664 | 27.403 |
| 44798.583333333336 | 27.455 |
| 44798.59375 | 27.675 |
| 44798.604166666664 | 27.743 |
| 44798.614583333336 | 27.918 |
| 44798.625 | 28.021 |
| 44798.635416666664 | 28.094 |
| 44798.645833333336 | 28.279 |
| 44798.65625 | 28.384 |
| 44798.666666666664 | 28.483 |
| 44798.677083333336 | 28.629 |
| 44798.6875 | 28.697 |
| 44798.697916666664 | 28.699 |
| 44798.708333333336 | 28.724 |
| 44798.71875 | 28.744 |
| 44798.729166666664 | 28.905 |
| 44798.739583333336 | 29.065 |
| 44798.75 | 29.241 |
| 44798.760416666664 | 29.377 |
| 44798.770833333336 | 29.317 |
| 44798.78125 | 29.277 |
| 44798.791666666664 | 29.294 |
| 44798.802083333336 | 29.273 |
| 44798.8125 | 29.31 |
| 44798.822916666664 | 29.318 |
| 44798.833333333336 | 29.321 |
| 44798.84375 | 29.335 |
| 44798.854166666664 | 29.369 |
| 44798.864583333336 | 29.374 |
| 44798.875 | 29.363 |
| 44798.885416666664 | 29.354 |
| 44798.895833333336 | 29.354 |
| 44798.90625 | 29.349 |
| 44798.916666666664 | 29.329 |
| 44798.927083333336 | 29.308 |
| 44798.9375 | 29.264 |
| 44798.947916666664 | 29.202 |
| 44798.958333333336 | 29.096 |
| 44798.96875 | 28.941 |
| 44798.979166666664 | 28.87 |
| 44798.989583333336 | 28.905 |
| 44799.0 | 28.902 |
| 44799.010416666664 | 28.895 |
| 44799.020833333336 | 28.886 |
| 44799.03125 | 28.839 |
| 44799.041666666664 | 28.804 |
| 44799.052083333336 | 28.888 |
| 44799.0625 | 28.779 |
| 44799.072916666664 | 28.56 |
| 44799.083333333336 | 28.406 |
| 44799.09375 | 28.366 |
| 44799.104166666664 | 28.238 |
| 44799.114583333336 | 28.213 |
| 44799.125 | 28.113 |
| 44799.135416666664 | 28.117 |
| 44799.145833333336 | 28.044 |
| 44799.15625 | 27.972 |
| 44799.166666666664 | 28.005 |
| 44799.177083333336 | 28.06 |
| 44799.1875 | 27.934 |
| 44799.197916666664 | 28.004 |
| 44799.208333333336 | 27.997 |
| 44799.21875 | 27.891 |
| 44799.229166666664 | 27.97 |
| 44799.239583333336 | 27.977 |
| 44799.25 | 27.904 |
| 44799.260416666664 | 28.009 |
| 44799.270833333336 | 27.959 |
| 44799.28125 | 27.939 |
| 44799.291666666664 | 27.959 |
| 44799.302083333336 | 27.896 |
| 44799.3125 | 27.869 |
| 44799.322916666664 | 27.887 |
| 44799.333333333336 | 27.887 |
| 44799.34375 | 27.865 |
| 44799.354166666664 | 27.773 |
| 44799.364583333336 | 27.739 |
| 44799.375 | 27.666 |
| 44799.385416666664 | 27.54 |
| 44799.395833333336 | 27.494 |
| 44799.40625 | 27.445 |
| 44799.416666666664 | 27.399 |
| 44799.427083333336 | 27.346 |
| 44799.4375 | 27.305 |
| 44799.447916666664 | 27.262 |
| 44799.458333333336 | 27.24 |
| 44799.46875 | 27.231 |
| 44799.479166666664 | 27.221 |
| 44799.489583333336 | 27.22 |
| 44799.5 | 27.213 |
| 44799.510416666664 | 27.198 |
| 44799.520833333336 | 27.174 |
| 44799.53125 | 27.134 |
| 44799.541666666664 | 27.124 |
| 44799.552083333336 | 27.391 |
| 44799.5625 | 27.315 |
| 44799.572916666664 | 27.332 |
| 44799.583333333336 | 27.367 |
| 44799.59375 | 27.356 |
| 44799.604166666664 | 27.511 |
| 44799.614583333336 | 27.604 |
| 44799.625 | 27.739 |
| 44799.635416666664 | 27.846 |
| 44799.645833333336 | 28.198 |
| 44799.65625 | 28.228 |
| 44799.666666666664 | 28.299 |
| 44799.677083333336 | 28.432 |
| 44799.6875 | 28.566 |
| 44799.697916666664 | 28.781 |
| 44799.708333333336 | 28.929 |
| 44799.71875 | 29.05 |
| 44799.729166666664 | 29.195 |
| 44799.739583333336 | 29.285 |
| 44799.75 | 29.344 |
| 44799.760416666664 | 29.412 |
| 44799.770833333336 | 29.448 |
| 44799.78125 | 29.488 |
| 44799.791666666664 | 29.558 |
| 44799.802083333336 | 29.526 |
| 44799.8125 | 29.346 |
| 44799.822916666664 | 29.286 |
| 44799.833333333336 | 29.258 |
| 44799.84375 | 29.257 |
| 44799.854166666664 | 29.24 |
| 44799.864583333336 | 29.246 |
| 44799.875 | 29.267 |
| 44799.885416666664 | 29.324 |
| 44799.895833333336 | 29.359 |
| 44799.90625 | 29.369 |
| 44799.916666666664 | 29.364 |
| 44799.927083333336 | 29.349 |
| 44799.9375 | 29.29 |
| 44799.947916666664 | 29.238 |
| 44799.958333333336 | 29.21 |
| 44799.96875 | 29.201 |
| 44799.979166666664 | 29.075 |
| 44799.989583333336 | 28.93 |
| 44800.0 | 28.732 |
| 44800.010416666664 | 28.654 |
| 44800.020833333336 | 28.546 |
| 44800.03125 | 28.48 |
| 44800.041666666664 | 28.395 |
| 44800.052083333336 | 28.36 |
| 44800.0625 | 28.321 |
| 44800.072916666664 | 28.432 |
| 44800.083333333336 | 28.48 |
| 44800.09375 | 28.35 |
| 44800.104166666664 | 28.171 |
| 44800.114583333336 | 28.2 |
| 44800.125 | 28.153 |
| 44800.135416666664 | 28.088 |
| 44800.145833333336 | 28.071 |
| 44800.15625 | 28.107 |
| 44800.166666666664 | 27.947 |
| 44800.177083333336 | 27.907 |
| 44800.1875 | 27.884 |
| 44800.197916666664 | 27.798 |
| 44800.208333333336 | 27.783 |
| 44800.21875 | 27.767 |
| 44800.229166666664 | 27.699 |
| 44800.239583333336 | 27.714 |
| 44800.25 | 27.705 |
| 44800.260416666664 | 27.763 |
| 44800.270833333336 | 27.715 |
| 44800.28125 | 27.727 |
| 44800.291666666664 | 27.731 |
| 44800.302083333336 | 27.678 |
| 44800.3125 | 27.648 |
| 44800.322916666664 | 27.643 |
| 44800.333333333336 | 27.635 |
| 44800.34375 | 27.652 |
| 44800.354166666664 | 27.659 |
| 44800.364583333336 | 27.649 |
| 44800.375 | 27.595 |
| 44800.385416666664 | 27.545 |
| 44800.395833333336 | 27.497 |
| 44800.40625 | 27.429 |
| 44800.416666666664 | 27.372 |
| 44800.427083333336 | 27.342 |
| 44800.4375 | 27.326 |
| 44800.447916666664 | 27.288 |
| 44800.458333333336 | 27.246 |
| 44800.46875 | 27.229 |
| 44800.479166666664 | 27.211 |
| 44800.489583333336 | 27.207 |
| 44800.5 | 27.208 |
| 44800.510416666664 | 27.212 |
| 44800.520833333336 | 27.205 |
| 44800.53125 | 27.169 |
| 44800.541666666664 | 27.172 |
| 44800.552083333336 | 27.191 |
| 44800.5625 | 27.225 |
| 44800.572916666664 | 27.239 |
| 44800.583333333336 | 27.313 |
| 44800.59375 | 27.625 |
| 44800.604166666664 | 27.521 |
| 44800.614583333336 | 27.826 |
| 44800.625 | 28.136 |
| 44800.635416666664 | 28.261 |
| 44800.645833333336 | 28.636 |
| 44800.65625 | 28.667 |
| 44800.666666666664 | 28.281 |
| 44800.677083333336 | 28.898 |
| 44800.6875 | 28.614 |
| 44800.697916666664 | 28.851 |
| 44800.708333333336 | 29.079 |
| 44800.71875 | 29.261 |
| 44800.729166666664 | 29.326 |
| 44800.739583333336 | 29.453 |
| 44800.75 | 29.675 |
| 44800.760416666664 | 29.79 |
| 44800.770833333336 | 29.89 |
| 44800.78125 | 29.79 |
| 44800.791666666664 | 29.731 |
| 44800.802083333336 | 29.665 |
| 44800.8125 | 29.627 |
| 44800.822916666664 | 29.664 |
| 44800.833333333336 | 29.601 |
| 44800.84375 | 29.581 |
| 44800.854166666664 | 29.559 |
| 44800.864583333336 | 29.551 |
| 44800.875 | 29.53 |
| 44800.885416666664 | 29.437 |
| 44800.895833333336 | 29.35 |
| 44800.90625 | 29.207 |
| 44800.916666666664 | 29.122 |
| 44800.927083333336 | 29.058 |
| 44800.9375 | 28.998 |
| 44800.947916666664 | 28.935 |
| 44800.958333333336 | 28.877 |
| 44800.96875 | 28.858 |
| 44800.979166666664 | 28.817 |
| 44800.989583333336 | 28.822 |
| 44801.0 | 28.789 |
| 44801.010416666664 | 28.712 |
| 44801.020833333336 | 28.615 |
| 44801.03125 | 28.555 |
| 44801.041666666664 | 28.478 |
| 44801.052083333336 | 28.445 |
| 44801.0625 | 28.358 |
| 44801.072916666664 | 28.38 |
| 44801.083333333336 | 28.366 |
| 44801.09375 | 28.342 |
| 44801.104166666664 | 28.362 |
| 44801.114583333336 | 28.291 |
| 44801.125 | 28.301 |
| 44801.135416666664 | 28.291 |
| 44801.145833333336 | 28.298 |
| 44801.15625 | 28.277 |
| 44801.166666666664 | 28.241 |
| 44801.177083333336 | 28.225 |
| 44801.1875 | 28.156 |
| 44801.197916666664 | 28.127 |
| 44801.208333333336 | 28.092 |
| 44801.21875 | 28.048 |
| 44801.229166666664 | 28.089 |
| 44801.239583333336 | 28.098 |
| 44801.25 | 28.062 |
| 44801.260416666664 | 28.095 |
| 44801.270833333336 | 28.143 |
| 44801.28125 | 28.108 |
| 44801.291666666664 | 28.101 |
| 44801.302083333336 | 28.142 |
| 44801.3125 | 28.106 |
| 44801.322916666664 | 28.087 |
| 44801.333333333336 | 28.104 |
| 44801.34375 | 28.145 |
| 44801.354166666664 | 28.018 |
| 44801.364583333336 | 28.059 |
| 44801.375 | 28.064 |
| 44801.385416666664 | 28.053 |
| 44801.395833333336 | 28.004 |
| 44801.40625 | 27.958 |
| 44801.416666666664 | 27.892 |
| 44801.427083333336 | 27.828 |
| 44801.4375 | 27.798 |
| 44801.447916666664 | 27.789 |
| 44801.458333333336 | 27.752 |
| 44801.46875 | 27.712 |
| 44801.479166666664 | 27.674 |
| 44801.489583333336 | 27.657 |
| 44801.5 | 27.649 |
| 44801.510416666664 | 27.646 |
| 44801.520833333336 | 27.655 |
| 44801.53125 | 27.662 |
| 44801.541666666664 | 27.648 |
| 44801.552083333336 | 27.669 |
| 44801.5625 | 27.69 |
| 44801.572916666664 | 27.706 |
| 44801.583333333336 | 27.716 |
| 44801.59375 | 27.759 |
| 44801.604166666664 | 27.811 |
| 44801.614583333336 | 28.061 |
| 44801.625 | 27.996 |
| 44801.635416666664 | 28.107 |
| 44801.645833333336 | 28.444 |
| 44801.65625 | 28.687 |
| 44801.666666666664 | 28.847 |
| 44801.677083333336 | 28.956 |
| 44801.6875 | 28.947 |
| 44801.697916666664 | 29.307 |
| 44801.708333333336 | 29.658 |
| 44801.71875 | 29.84 |
| 44801.729166666664 | 29.929 |
| 44801.739583333336 | 30.119 |
| 44801.75 | 30.173 |
| 44801.760416666664 | 30.341 |
| 44801.770833333336 | 30.489 |
| 44801.78125 | 30.687 |
| 44801.791666666664 | 30.651 |
| 44801.802083333336 | 30.793 |
| 44801.8125 | 30.983 |
| 44801.822916666664 | 31.056 |
| 44801.833333333336 | 31.209 |
| 44801.84375 | 31.186 |
| 44801.854166666664 | 31.079 |
| 44801.864583333336 | 30.954 |
| 44801.875 | 30.91 |
| 44801.885416666664 | 30.841 |
| 44801.895833333336 | 30.75 |
| 44801.90625 | 30.66 |
| 44801.916666666664 | 30.554 |
| 44801.927083333336 | 30.47 |
| 44801.9375 | 30.366 |
| 44801.947916666664 | 30.303 |
| 44801.958333333336 | 30.25 |
| 44801.96875 | 30.185 |
| 44801.979166666664 | 30.088 |
| 44801.989583333336 | 30.029 |
| 44802.0 | 29.952 |
| 44802.010416666664 | 29.882 |
| 44802.020833333336 | 29.803 |
| 44802.03125 | 29.716 |
| 44802.041666666664 | 29.583 |
| 44802.052083333336 | 29.481 |
| 44802.0625 | 29.351 |
| 44802.072916666664 | 29.222 |
| 44802.083333333336 | 29.147 |
| 44802.09375 | 29.097 |
| 44802.104166666664 | 29.044 |
| 44802.114583333336 | 29.354 |
| 44802.125 | 29.498 |
| 44802.135416666664 | 28.926 |
| 44802.145833333336 | 28.844 |
| 44802.15625 | 28.855 |
| 44802.166666666664 | 28.891 |
| 44802.177083333336 | 29.05 |
| 44802.1875 | 28.921 |
| 44802.197916666664 | 28.909 |
| 44802.208333333336 | 28.871 |
| 44802.21875 | 28.852 |
| 44802.229166666664 | 28.778 |
| 44802.239583333336 | 28.801 |
| 44802.25 | 28.833 |
| 44802.260416666664 | 28.773 |
| 44802.270833333336 | 28.76 |
| 44802.28125 | 28.839 |
| 44802.291666666664 | 28.873 |
| 44802.302083333336 | 28.872 |
| 44802.3125 | 28.905 |
| 44802.322916666664 | 28.963 |
| 44802.333333333336 | 28.986 |
| 44802.34375 | 28.974 |
| 44802.354166666664 | 28.922 |
| 44802.364583333336 | 29.026 |
| 44802.375 | 28.903 |
| 44802.385416666664 | 28.794 |
| 44802.395833333336 | 28.874 |
| 44802.40625 | 28.854 |
| 44802.416666666664 | 28.783 |
| 44802.427083333336 | 28.737 |
| 44802.4375 | 28.625 |
| 44802.447916666664 | 28.509 |
| 44802.458333333336 | 28.454 |
| 44802.46875 | 28.429 |
| 44802.479166666664 | 28.396 |
| 44802.489583333336 | 28.345 |
| 44802.5 | 28.311 |
| 44802.510416666664 | 28.25 |
| 44802.520833333336 | 28.241 |
| 44802.53125 | 28.229 |
| 44802.541666666664 | 28.241 |
| 44802.552083333336 | 28.233 |
| 44802.5625 | 28.232 |
| 44802.572916666664 | 28.204 |
| 44802.583333333336 | 28.185 |
| 44802.59375 | 28.206 |
| 44802.604166666664 | 28.216 |
| 44802.614583333336 | 28.213 |
| 44802.625 | 28.236 |
| 44802.635416666664 | 28.485 |
| 44802.645833333336 | 28.487 |
| 44802.65625 | 28.794 |
| 44802.666666666664 | 29.231 |
| 44802.677083333336 | 29.375 |
| 44802.6875 | 29.478 |
| 44802.697916666664 | 29.606 |
| 44802.708333333336 | 29.615 |
| 44802.71875 | 29.867 |
| 44802.729166666664 | 30.063 |
| 44802.739583333336 | 30.272 |
| 44802.75 | 30.297 |
| 44802.760416666664 | 30.614 |
| 44802.770833333336 | 30.719 |
| 44802.78125 | 30.967 |
| 44802.791666666664 | 31.131 |
| 44802.802083333336 | 31.425 |
| 44802.8125 | 31.485 |
| 44802.822916666664 | 31.611 |
| 44802.833333333336 | 31.631 |
| 44802.84375 | 31.72 |
| 44802.854166666664 | 31.766 |
| 44802.864583333336 | 31.919 |
| 44802.875 | 31.865 |
| 44802.885416666664 | 31.716 |
| 44802.895833333336 | 31.608 |
| 44802.90625 | 31.606 |
| 44802.916666666664 | 31.497 |
| 44802.927083333336 | 31.414 |
| 44802.9375 | 31.284 |
| 44802.947916666664 | 31.143 |
| 44802.958333333336 | 31.036 |
| 44802.96875 | 30.921 |
| 44802.979166666664 | 30.789 |
| 44802.989583333336 | 30.709 |
| 44803.0 | 30.568 |
| 44803.010416666664 | 30.479 |
| 44803.020833333336 | 30.38 |
| 44803.03125 | 30.38 |
| 44803.041666666664 | 30.273 |
| 44803.052083333336 | 30.118 |
| 44803.0625 | 30.076 |
| 44803.072916666664 | 29.998 |
| 44803.083333333336 | 29.976 |
| 44803.09375 | 29.911 |
| 44803.104166666664 | 29.788 |
| 44803.114583333336 | 29.714 |
| 44803.125 | 29.614 |
| 44803.135416666664 | 29.524 |
| 44803.145833333336 | 29.923 |
| 44803.15625 | 29.8 |
| 44803.166666666664 | 29.376 |
| 44803.177083333336 | 29.271 |
| 44803.1875 | 29.304 |
| 44803.197916666664 | 29.333 |
| 44803.208333333336 | 29.314 |
| 44803.21875 | 29.429 |
| 44803.229166666664 | 29.287 |
| 44803.239583333336 | 29.206 |
| 44803.25 | 29.164 |
| 44803.260416666664 | 29.188 |
| 44803.270833333336 | 29.133 |
| 44803.28125 | 29.24 |
| 44803.291666666664 | 29.202 |
| 44803.302083333336 | 29.223 |
| 44803.3125 | 29.308 |
| 44803.322916666664 | 29.259 |
| 44803.333333333336 | 29.266 |
| 44803.34375 | 29.452 |
| 44803.354166666664 | 29.377 |
| 44803.364583333336 | 29.446 |
| 44803.375 | 29.487 |
| 44803.385416666664 | 29.461 |
| 44803.395833333336 | 29.488 |
| 44803.40625 | 29.345 |
| 44803.416666666664 | 29.31 |
| 44803.427083333336 | 29.381 |
| 44803.4375 | 29.342 |
| 44803.447916666664 | 29.242 |
| 44803.458333333336 | 29.189 |
| 44803.46875 | 29.104 |
| 44803.479166666664 | 28.956 |
| 44803.489583333336 | 28.861 |
| 44803.5 | 28.831 |
| 44803.510416666664 | 28.794 |
| 44803.520833333336 | 28.763 |
| 44803.53125 | 28.736 |
| 44803.541666666664 | 28.739 |
| 44803.552083333336 | 28.73 |
| 44803.5625 | 28.732 |
| 44803.572916666664 | 28.747 |
| 44803.583333333336 | 28.787 |
| 44803.59375 | 28.829 |
| 44803.604166666664 | 28.859 |
| 44803.614583333336 | 28.885 |
| 44803.625 | 28.925 |
| 44803.635416666664 | 28.954 |
| 44803.645833333336 | 28.995 |
| 44803.65625 | 29.046 |
| 44803.666666666664 | 29.12 |
| 44803.677083333336 | 29.4 |
| 44803.6875 | 29.377 |
| 44803.697916666664 | 29.979 |
| 44803.708333333336 | 30.281 |
| 44803.71875 | 30.693 |
| 44803.729166666664 | 30.902 |
| 44803.739583333336 | 31.185 |
| 44803.75 | 31.399 |
| 44803.760416666664 | 31.496 |
| 44803.770833333336 | 31.644 |
| 44803.78125 | 31.535 |
| 44803.791666666664 | 31.61 |
| 44803.802083333336 | 31.519 |
| 44803.8125 | 31.81 |
| 44803.822916666664 | 31.902 |
| 44803.833333333336 | 31.942 |
| 44803.84375 | 32.025 |
| 44803.854166666664 | 31.989 |
| 44803.864583333336 | 31.94 |
| 44803.875 | 31.915 |
| 44803.885416666664 | 31.886 |
| 44803.895833333336 | 31.817 |
| 44803.90625 | 31.819 |
| 44803.916666666664 | 31.744 |
| 44803.927083333336 | 31.678 |
| 44803.9375 | 31.583 |
| 44803.947916666664 | 31.482 |
| 44803.958333333336 | 31.371 |
| 44803.96875 | 31.17 |
| 44803.979166666664 | 30.98 |
| 44803.989583333336 | 30.857 |
| 44804.0 | 30.726 |
| 44804.010416666664 | 30.642 |
| 44804.020833333336 | 30.538 |
| 44804.03125 | 30.447 |
| 44804.041666666664 | 30.37 |
| 44804.052083333336 | 30.283 |
| 44804.0625 | 30.22 |
| 44804.072916666664 | 30.175 |
| 44804.083333333336 | 30.138 |
| 44804.09375 | 30.095 |
| 44804.104166666664 | 30.045 |
| 44804.114583333336 | 29.97 |
| 44804.125 | 29.894 |
| 44804.135416666664 | 29.831 |
| 44804.145833333336 | 29.76 |
| 44804.15625 | 29.745 |
| 44804.166666666664 | 29.854 |
| 44804.177083333336 | 29.872 |
| 44804.1875 | 29.711 |
| 44804.197916666664 | 29.685 |
| 44804.208333333336 | 29.491 |
| 44804.21875 | 29.546 |
| 44804.229166666664 | 29.296 |
| 44804.239583333336 | 29.16 |
| 44804.25 | 29.194 |
| 44804.260416666664 | 29.081 |
| 44804.270833333336 | 28.986 |
| 44804.28125 | 29.047 |
| 44804.291666666664 | 28.993 |
| 44804.302083333336 | 28.984 |
| 44804.3125 | 28.979 |
| 44804.322916666664 | 29.003 |
| 44804.333333333336 | 29.144 |
| 44804.34375 | 29.09 |
| 44804.354166666664 | 29.071 |
| 44804.364583333336 | 29.144 |
| 44804.375 | 29.134 |
| 44804.385416666664 | 29.042 |
| 44804.395833333336 | 29.054 |
| 44804.40625 | 29.097 |
| 44804.416666666664 | 29.087 |
| 44804.427083333336 | 29 |
| 44804.4375 | 28.918 |
| 44804.447916666664 | 28.936 |
| 44804.458333333336 | 28.987 |
| 44804.46875 | 28.964 |
| 44804.479166666664 | 28.914 |
| 44804.489583333336 | 28.827 |
| 44804.5 | 28.7 |
| 44804.510416666664 | 28.562 |
| 44804.520833333336 | 28.5 |
| 44804.53125 | 28.447 |
| 44804.541666666664 | 28.394 |
| 44804.552083333336 | 28.359 |
| 44804.5625 | 28.347 |
| 44804.572916666664 | 28.359 |
| 44804.583333333336 | 28.377 |
| 44804.59375 | 28.421 |
| 44804.604166666664 | 28.491 |
| 44804.614583333336 | 28.565 |
| 44804.625 | 28.629 |
| 44804.635416666664 | 28.689 |
| 44804.645833333336 | 28.742 |
| 44804.65625 | 28.79 |
| 44804.666666666664 | 28.84 |
| 44804.677083333336 | 28.855 |
| 44804.6875 | 28.886 |
| 44804.697916666664 | 29.126 |
| 44804.708333333336 | 29.177 |
| 44804.71875 | 29.316 |
| 44804.729166666664 | 29.49 |
| 44804.739583333336 | 29.674 |
| 44804.75 | 29.767 |
| 44804.760416666664 | 29.924 |
| 44804.770833333336 | 29.975 |
| 44804.78125 | 30.057 |
| 44804.791666666664 | 30.312 |
| 44804.802083333336 | 30.456 |
| 44804.8125 | 30.474 |
| 44804.822916666664 | 30.409 |
| 44804.833333333336 | 30.512 |
| 44804.84375 | 30.417 |
| 44804.854166666664 | 30.439 |
| 44804.864583333336 | 30.466 |
| 44804.875 | 30.421 |
| 44804.885416666664 | 30.365 |
| 44804.895833333336 | 30.347 |
| 44804.90625 | 30.278 |
| 44804.916666666664 | 30.233 |
| 44804.927083333336 | 30.254 |
| 44804.9375 | 30.169 |
| 44804.947916666664 | 30.1 |
| 44804.958333333336 | 30.069 |
| 44804.96875 | 30.058 |
| 44804.979166666664 | 30.019 |
| 44804.989583333336 | 29.983 |
| 44805.0 | 29.923 |
| 44805.010416666664 | 29.815 |
| 44805.020833333336 | 29.678 |
| 44805.03125 | 29.567 |
| 44805.041666666664 | 29.445 |
| 44805.052083333336 | 29.369 |
| 44805.0625 | 29.288 |
| 44805.072916666664 | 29.237 |
| 44805.083333333336 | 29.137 |
| 44805.09375 | 29.082 |
| 44805.104166666664 | 29.031 |
| 44805.114583333336 | 28.984 |
| 44805.125 | 28.929 |
| 44805.135416666664 | 28.864 |
| 44805.145833333336 | 28.816 |